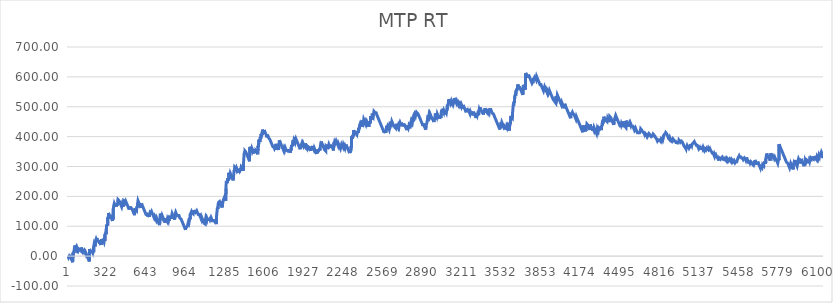
| Category | MTP RT |
|---|---|
| 0 | -1 |
| 1 | -2 |
| 2 | -3 |
| 3 | -4 |
| 4 | -5 |
| 5 | -6 |
| 6 | -7 |
| 7 | -8 |
| 8 | -1.41 |
| 9 | -2.42 |
| 10 | -3.43 |
| 11 | -4.44 |
| 12 | -5.45 |
| 13 | 4 |
| 14 | 2.95 |
| 15 | 1.9 |
| 16 | 0.9 |
| 17 | -0.1 |
| 18 | -1.1 |
| 19 | -2.1 |
| 20 | -3.1 |
| 21 | -4.1 |
| 22 | -5.1 |
| 23 | -6.1 |
| 24 | -7.1 |
| 25 | -8.1 |
| 26 | -9.1 |
| 27 | -10.1 |
| 28 | -11.1 |
| 29 | -12.1 |
| 30 | -13.1 |
| 31 | -14.1 |
| 32 | -15.1 |
| 33 | -16.1 |
| 34 | -17.1 |
| 35 | -18.1 |
| 36 | -19.224 |
| 37 | -20.348 |
| 38 | -21.472 |
| 39 | -22.596 |
| 40 | 12.28 |
| 41 | 11.28 |
| 42 | 10.28 |
| 43 | 9.28 |
| 44 | 8.28 |
| 45 | 7.28 |
| 46 | 6.25 |
| 47 | 15.22 |
| 48 | 14.19 |
| 49 | 13.16 |
| 50 | 12.102 |
| 51 | 11.045 |
| 52 | 25.488 |
| 53 | 24.43 |
| 54 | 23.396 |
| 55 | 35.862 |
| 56 | 34.828 |
| 57 | 33.794 |
| 58 | 32.76 |
| 59 | 31.76 |
| 60 | 30.76 |
| 61 | 29.76 |
| 62 | 28.76 |
| 63 | 27.76 |
| 64 | 26.76 |
| 65 | 25.76 |
| 66 | 24.76 |
| 67 | 23.76 |
| 68 | 22.76 |
| 69 | 27.343 |
| 70 | 26.327 |
| 71 | 25.31 |
| 72 | 24.31 |
| 73 | 23.31 |
| 74 | 22.31 |
| 75 | 27.3 |
| 76 | 26.29 |
| 77 | 25.28 |
| 78 | 24.27 |
| 79 | 23.27 |
| 80 | 22.27 |
| 81 | 21.27 |
| 82 | 20.27 |
| 83 | 19.27 |
| 84 | 18.27 |
| 85 | 17.27 |
| 86 | 16.27 |
| 87 | 23.648 |
| 88 | 22.625 |
| 89 | 21.602 |
| 90 | 20.58 |
| 91 | 25.272 |
| 92 | 24.265 |
| 93 | 23.257 |
| 94 | 22.25 |
| 95 | 21.25 |
| 96 | 20.25 |
| 97 | 19.25 |
| 98 | 18.25 |
| 99 | 17.25 |
| 100 | 22.14 |
| 101 | 21.13 |
| 102 | 20.12 |
| 103 | 19.11 |
| 104 | 18.078 |
| 105 | 17.046 |
| 106 | 29.014 |
| 107 | 27.982 |
| 108 | 26.95 |
| 109 | 25.95 |
| 110 | 24.95 |
| 111 | 23.95 |
| 112 | 22.95 |
| 113 | 21.95 |
| 114 | 20.95 |
| 115 | 19.95 |
| 116 | 18.95 |
| 117 | 17.95 |
| 118 | 16.95 |
| 119 | 15.95 |
| 120 | 14.95 |
| 121 | 13.95 |
| 122 | 12.95 |
| 123 | 11.95 |
| 124 | 10.95 |
| 125 | 16.146 |
| 126 | 15.142 |
| 127 | 14.138 |
| 128 | 13.134 |
| 129 | 12.13 |
| 130 | 11.114 |
| 131 | 19.098 |
| 132 | 18.082 |
| 133 | 17.066 |
| 134 | 16.05 |
| 135 | 15.05 |
| 136 | 14.05 |
| 137 | 13.05 |
| 138 | 12.05 |
| 139 | 11.05 |
| 140 | 10.05 |
| 141 | 9.05 |
| 142 | 8.05 |
| 143 | 7.05 |
| 144 | 6.05 |
| 145 | 10.433 |
| 146 | 9.417 |
| 147 | 8.4 |
| 148 | 7.4 |
| 149 | 6.4 |
| 150 | 5.4 |
| 151 | 4.4 |
| 152 | 3.4 |
| 153 | 2.4 |
| 154 | 1.4 |
| 155 | 0.4 |
| 156 | -0.6 |
| 157 | -1.6 |
| 158 | -2.6 |
| 159 | -3.6 |
| 160 | -4.6 |
| 161 | -5.6 |
| 162 | -6.6 |
| 163 | -7.6 |
| 164 | -8.6 |
| 165 | -9.6 |
| 166 | -10.6 |
| 167 | -11.6 |
| 168 | -12.6 |
| 169 | -13.6 |
| 170 | -14.6 |
| 171 | -15.6 |
| 172 | -16.8 |
| 173 | -18 |
| 174 | -19.2 |
| 175 | 23.6 |
| 176 | 22.6 |
| 177 | 21.6 |
| 178 | 20.6 |
| 179 | 19.6 |
| 180 | 18.6 |
| 181 | 17.6 |
| 182 | 16.6 |
| 183 | 15.6 |
| 184 | 14.6 |
| 185 | 13.6 |
| 186 | 12.6 |
| 187 | 11.6 |
| 188 | 18.986 |
| 189 | 17.972 |
| 190 | 16.958 |
| 191 | 15.944 |
| 192 | 14.93 |
| 193 | 13.93 |
| 194 | 12.93 |
| 195 | 11.93 |
| 196 | 10.93 |
| 197 | 14.93 |
| 198 | 13.93 |
| 199 | 12.93 |
| 200 | 11.93 |
| 201 | 10.93 |
| 202 | 9.93 |
| 203 | 8.93 |
| 204 | 17.09 |
| 205 | 16.05 |
| 206 | 15.01 |
| 207 | 13.905 |
| 208 | 12.8 |
| 209 | 11.695 |
| 210 | 35.59 |
| 211 | 34.575 |
| 212 | 40.76 |
| 213 | 39.745 |
| 214 | 38.73 |
| 215 | 37.73 |
| 216 | 36.73 |
| 217 | 35.73 |
| 218 | 34.73 |
| 219 | 33.73 |
| 220 | 32.73 |
| 221 | 31.64 |
| 222 | 41.55 |
| 223 | 40.516 |
| 224 | 52.982 |
| 225 | 51.948 |
| 226 | 50.914 |
| 227 | 49.88 |
| 228 | 57.86 |
| 229 | 56.84 |
| 230 | 55.82 |
| 231 | 54.8 |
| 232 | 53.785 |
| 233 | 59.77 |
| 234 | 58.755 |
| 235 | 57.74 |
| 236 | 56.74 |
| 237 | 55.74 |
| 238 | 54.74 |
| 239 | 53.74 |
| 240 | 52.74 |
| 241 | 51.74 |
| 242 | 50.74 |
| 243 | 49.74 |
| 244 | 52.67 |
| 245 | 51.65 |
| 246 | 50.65 |
| 247 | 49.65 |
| 248 | 48.65 |
| 249 | 47.65 |
| 250 | 53.044 |
| 251 | 52.038 |
| 252 | 51.032 |
| 253 | 50.026 |
| 254 | 49.02 |
| 255 | 48.02 |
| 256 | 47.02 |
| 257 | 46.02 |
| 258 | 45.02 |
| 259 | 44.02 |
| 260 | 43.02 |
| 261 | 45.667 |
| 262 | 44.663 |
| 263 | 43.66 |
| 264 | 42.66 |
| 265 | 41.66 |
| 266 | 40.66 |
| 267 | 39.66 |
| 268 | 38.66 |
| 269 | 37.57 |
| 270 | 36.48 |
| 271 | 57.39 |
| 272 | 56.3 |
| 273 | 55.3 |
| 274 | 54.3 |
| 275 | 53.3 |
| 276 | 52.3 |
| 277 | 51.3 |
| 278 | 50.3 |
| 279 | 49.3 |
| 280 | 48.3 |
| 281 | 47.3 |
| 282 | 46.3 |
| 283 | 45.278 |
| 284 | 54.756 |
| 285 | 53.734 |
| 286 | 52.712 |
| 287 | 51.69 |
| 288 | 50.69 |
| 289 | 49.69 |
| 290 | 48.69 |
| 291 | 47.69 |
| 292 | 46.69 |
| 293 | 45.666 |
| 294 | 44.642 |
| 295 | 54.618 |
| 296 | 53.594 |
| 297 | 52.57 |
| 298 | 51.49 |
| 299 | 50.41 |
| 300 | 49.33 |
| 301 | 73.25 |
| 302 | 72.17 |
| 303 | 71.17 |
| 304 | 70.17 |
| 305 | 76.958 |
| 306 | 75.946 |
| 307 | 74.934 |
| 308 | 73.922 |
| 309 | 72.91 |
| 310 | 71.73 |
| 311 | 70.55 |
| 312 | 99.37 |
| 313 | 105.162 |
| 314 | 104.154 |
| 315 | 103.146 |
| 316 | 102.138 |
| 317 | 101.13 |
| 318 | 107.315 |
| 319 | 106.3 |
| 320 | 105.285 |
| 321 | 104.27 |
| 322 | 103.11 |
| 323 | 128.95 |
| 324 | 127.79 |
| 325 | 126.705 |
| 326 | 125.62 |
| 327 | 124.535 |
| 328 | 144.45 |
| 329 | 143.45 |
| 330 | 142.45 |
| 331 | 141.45 |
| 332 | 140.45 |
| 333 | 139.45 |
| 334 | 138.45 |
| 335 | 137.45 |
| 336 | 136.45 |
| 337 | 135.45 |
| 338 | 134.45 |
| 339 | 133.45 |
| 340 | 132.45 |
| 341 | 137.827 |
| 342 | 136.803 |
| 343 | 135.78 |
| 344 | 134.78 |
| 345 | 133.78 |
| 346 | 132.78 |
| 347 | 131.78 |
| 348 | 130.78 |
| 349 | 129.78 |
| 350 | 128.78 |
| 351 | 127.78 |
| 352 | 126.78 |
| 353 | 125.78 |
| 354 | 124.78 |
| 355 | 123.78 |
| 356 | 122.78 |
| 357 | 121.78 |
| 358 | 120.78 |
| 359 | 119.78 |
| 360 | 118.78 |
| 361 | 117.78 |
| 362 | 126.733 |
| 363 | 125.687 |
| 364 | 124.64 |
| 365 | 123.46 |
| 366 | 122.28 |
| 367 | 121.1 |
| 368 | 159.92 |
| 369 | 158.878 |
| 370 | 157.836 |
| 371 | 156.794 |
| 372 | 171.252 |
| 373 | 170.21 |
| 374 | 169.198 |
| 375 | 176.386 |
| 376 | 175.374 |
| 377 | 174.362 |
| 378 | 173.35 |
| 379 | 172.35 |
| 380 | 171.35 |
| 381 | 170.35 |
| 382 | 169.35 |
| 383 | 168.346 |
| 384 | 173.342 |
| 385 | 172.338 |
| 386 | 171.334 |
| 387 | 170.33 |
| 388 | 169.33 |
| 389 | 168.33 |
| 390 | 167.33 |
| 391 | 166.33 |
| 392 | 165.33 |
| 393 | 164.26 |
| 394 | 172.39 |
| 395 | 171.39 |
| 396 | 170.39 |
| 397 | 169.39 |
| 398 | 168.39 |
| 399 | 167.364 |
| 400 | 177.838 |
| 401 | 176.812 |
| 402 | 175.786 |
| 403 | 174.76 |
| 404 | 173.692 |
| 405 | 172.625 |
| 406 | 189.057 |
| 407 | 187.99 |
| 408 | 192.177 |
| 409 | 191.163 |
| 410 | 190.15 |
| 411 | 189.15 |
| 412 | 188.15 |
| 413 | 187.15 |
| 414 | 186.15 |
| 415 | 185.15 |
| 416 | 184.15 |
| 417 | 183.15 |
| 418 | 182.15 |
| 419 | 181.15 |
| 420 | 180.15 |
| 421 | 179.15 |
| 422 | 178.15 |
| 423 | 177.15 |
| 424 | 176.15 |
| 425 | 175.15 |
| 426 | 174.15 |
| 427 | 173.15 |
| 428 | 172.15 |
| 429 | 171.15 |
| 430 | 170.15 |
| 431 | 169.15 |
| 432 | 168.15 |
| 433 | 167.15 |
| 434 | 166.15 |
| 435 | 165.15 |
| 436 | 164.15 |
| 437 | 163.15 |
| 438 | 162.15 |
| 439 | 173.122 |
| 440 | 172.094 |
| 441 | 171.066 |
| 442 | 170.038 |
| 443 | 169.01 |
| 444 | 168.01 |
| 445 | 167.01 |
| 446 | 166.01 |
| 447 | 164.926 |
| 448 | 163.842 |
| 449 | 162.758 |
| 450 | 161.674 |
| 451 | 186.59 |
| 452 | 185.59 |
| 453 | 184.59 |
| 454 | 183.59 |
| 455 | 189.178 |
| 456 | 188.165 |
| 457 | 187.152 |
| 458 | 186.14 |
| 459 | 185.14 |
| 460 | 184.14 |
| 461 | 183.14 |
| 462 | 182.14 |
| 463 | 181.14 |
| 464 | 180.14 |
| 465 | 179.14 |
| 466 | 178.14 |
| 467 | 177.08 |
| 468 | 184.22 |
| 469 | 183.22 |
| 470 | 182.22 |
| 471 | 181.22 |
| 472 | 180.22 |
| 473 | 179.22 |
| 474 | 178.22 |
| 475 | 177.22 |
| 476 | 176.22 |
| 477 | 175.22 |
| 478 | 174.22 |
| 479 | 173.22 |
| 480 | 172.22 |
| 481 | 171.22 |
| 482 | 170.22 |
| 483 | 169.22 |
| 484 | 168.22 |
| 485 | 167.22 |
| 486 | 166.22 |
| 487 | 165.22 |
| 488 | 164.22 |
| 489 | 163.22 |
| 490 | 162.22 |
| 491 | 161.22 |
| 492 | 160.22 |
| 493 | 159.22 |
| 494 | 158.22 |
| 495 | 157.22 |
| 496 | 156.2 |
| 497 | 165.18 |
| 498 | 164.16 |
| 499 | 163.14 |
| 500 | 162.12 |
| 501 | 161.12 |
| 502 | 160.12 |
| 503 | 159.12 |
| 504 | 158.12 |
| 505 | 157.12 |
| 506 | 156.12 |
| 507 | 165.09 |
| 508 | 164.06 |
| 509 | 163.03 |
| 510 | 162 |
| 511 | 161 |
| 512 | 160 |
| 513 | 159 |
| 514 | 157.992 |
| 515 | 162.285 |
| 516 | 161.278 |
| 517 | 160.27 |
| 518 | 159.27 |
| 519 | 158.27 |
| 520 | 157.27 |
| 521 | 156.27 |
| 522 | 155.27 |
| 523 | 154.27 |
| 524 | 153.27 |
| 525 | 152.27 |
| 526 | 151.27 |
| 527 | 150.27 |
| 528 | 149.27 |
| 529 | 148.27 |
| 530 | 147.27 |
| 531 | 146.27 |
| 532 | 145.27 |
| 533 | 144.27 |
| 534 | 143.27 |
| 535 | 142.27 |
| 536 | 141.27 |
| 537 | 140.27 |
| 538 | 139.27 |
| 539 | 138.225 |
| 540 | 137.18 |
| 541 | 149.135 |
| 542 | 148.09 |
| 543 | 147.013 |
| 544 | 160.437 |
| 545 | 159.36 |
| 546 | 158.36 |
| 547 | 157.36 |
| 548 | 156.36 |
| 549 | 155.36 |
| 550 | 154.36 |
| 551 | 153.36 |
| 552 | 156.36 |
| 553 | 155.36 |
| 554 | 154.36 |
| 555 | 153.36 |
| 556 | 152.36 |
| 557 | 151.31 |
| 558 | 150.26 |
| 559 | 166.71 |
| 560 | 165.66 |
| 561 | 164.61 |
| 562 | 163.58 |
| 563 | 162.55 |
| 564 | 174.02 |
| 565 | 172.99 |
| 566 | 171.96 |
| 567 | 170.918 |
| 568 | 185.376 |
| 569 | 184.334 |
| 570 | 183.292 |
| 571 | 182.25 |
| 572 | 181.25 |
| 573 | 180.25 |
| 574 | 179.25 |
| 575 | 178.25 |
| 576 | 177.25 |
| 577 | 176.25 |
| 578 | 175.25 |
| 579 | 174.25 |
| 580 | 173.25 |
| 581 | 172.25 |
| 582 | 171.25 |
| 583 | 170.25 |
| 584 | 169.25 |
| 585 | 168.25 |
| 586 | 167.25 |
| 587 | 166.25 |
| 588 | 165.25 |
| 589 | 164.25 |
| 590 | 163.25 |
| 591 | 162.25 |
| 592 | 161.25 |
| 593 | 160.25 |
| 594 | 159.172 |
| 595 | 158.095 |
| 596 | 176.518 |
| 597 | 175.44 |
| 598 | 174.44 |
| 599 | 173.44 |
| 600 | 172.44 |
| 601 | 171.44 |
| 602 | 170.44 |
| 603 | 169.44 |
| 604 | 168.44 |
| 605 | 167.44 |
| 606 | 166.44 |
| 607 | 165.44 |
| 608 | 164.44 |
| 609 | 163.44 |
| 610 | 162.44 |
| 611 | 161.44 |
| 612 | 160.44 |
| 613 | 159.44 |
| 614 | 158.44 |
| 615 | 157.44 |
| 616 | 156.44 |
| 617 | 155.44 |
| 618 | 154.44 |
| 619 | 153.44 |
| 620 | 152.44 |
| 621 | 151.44 |
| 622 | 150.44 |
| 623 | 149.44 |
| 624 | 148.44 |
| 625 | 147.44 |
| 626 | 146.44 |
| 627 | 145.44 |
| 628 | 144.44 |
| 629 | 143.44 |
| 630 | 142.44 |
| 631 | 141.44 |
| 632 | 140.44 |
| 633 | 139.44 |
| 634 | 138.44 |
| 635 | 137.44 |
| 636 | 136.44 |
| 637 | 135.41 |
| 638 | 144.38 |
| 639 | 143.35 |
| 640 | 142.32 |
| 641 | 141.32 |
| 642 | 140.32 |
| 643 | 139.32 |
| 644 | 138.32 |
| 645 | 137.32 |
| 646 | 136.32 |
| 647 | 135.32 |
| 648 | 134.32 |
| 649 | 133.32 |
| 650 | 132.295 |
| 651 | 131.27 |
| 652 | 139.045 |
| 653 | 138.02 |
| 654 | 137.02 |
| 655 | 136.02 |
| 656 | 135.02 |
| 657 | 134.02 |
| 658 | 133.02 |
| 659 | 131.998 |
| 660 | 130.976 |
| 661 | 140.454 |
| 662 | 139.432 |
| 663 | 138.41 |
| 664 | 141.045 |
| 665 | 140.03 |
| 666 | 139 |
| 667 | 147.97 |
| 668 | 146.94 |
| 669 | 145.91 |
| 670 | 150.9 |
| 671 | 149.89 |
| 672 | 148.88 |
| 673 | 147.87 |
| 674 | 146.87 |
| 675 | 145.87 |
| 676 | 144.87 |
| 677 | 143.87 |
| 678 | 142.87 |
| 679 | 148.258 |
| 680 | 147.245 |
| 681 | 146.232 |
| 682 | 145.22 |
| 683 | 144.22 |
| 684 | 143.22 |
| 685 | 142.22 |
| 686 | 141.22 |
| 687 | 140.22 |
| 688 | 139.22 |
| 689 | 138.22 |
| 690 | 137.22 |
| 691 | 136.22 |
| 692 | 135.22 |
| 693 | 134.22 |
| 694 | 133.22 |
| 695 | 132.22 |
| 696 | 131.22 |
| 697 | 130.22 |
| 698 | 129.22 |
| 699 | 128.22 |
| 700 | 127.22 |
| 701 | 126.22 |
| 702 | 125.18 |
| 703 | 132.94 |
| 704 | 131.9 |
| 705 | 130.9 |
| 706 | 129.9 |
| 707 | 128.9 |
| 708 | 127.9 |
| 709 | 126.9 |
| 710 | 125.9 |
| 711 | 124.9 |
| 712 | 123.9 |
| 713 | 122.9 |
| 714 | 121.9 |
| 715 | 120.9 |
| 716 | 119.9 |
| 717 | 118.876 |
| 718 | 117.852 |
| 719 | 127.828 |
| 720 | 126.804 |
| 721 | 125.78 |
| 722 | 124.78 |
| 723 | 123.78 |
| 724 | 122.78 |
| 725 | 121.78 |
| 726 | 120.78 |
| 727 | 119.78 |
| 728 | 118.78 |
| 729 | 117.78 |
| 730 | 116.78 |
| 731 | 115.78 |
| 732 | 114.78 |
| 733 | 113.78 |
| 734 | 112.78 |
| 735 | 111.78 |
| 736 | 110.78 |
| 737 | 109.78 |
| 738 | 108.78 |
| 739 | 107.78 |
| 740 | 106.78 |
| 741 | 105.78 |
| 742 | 104.78 |
| 743 | 103.78 |
| 744 | 102.78 |
| 745 | 101.53 |
| 746 | 127.28 |
| 747 | 126.177 |
| 748 | 125.073 |
| 749 | 142.47 |
| 750 | 141.47 |
| 751 | 140.47 |
| 752 | 139.47 |
| 753 | 138.47 |
| 754 | 137.47 |
| 755 | 136.47 |
| 756 | 135.47 |
| 757 | 134.47 |
| 758 | 133.47 |
| 759 | 132.47 |
| 760 | 131.47 |
| 761 | 130.47 |
| 762 | 129.47 |
| 763 | 128.456 |
| 764 | 136.042 |
| 765 | 135.028 |
| 766 | 134.014 |
| 767 | 133 |
| 768 | 132 |
| 769 | 131 |
| 770 | 130 |
| 771 | 129 |
| 772 | 128 |
| 773 | 127 |
| 774 | 126 |
| 775 | 125 |
| 776 | 124 |
| 777 | 123 |
| 778 | 122 |
| 779 | 121 |
| 780 | 120 |
| 781 | 119 |
| 782 | 118 |
| 783 | 117 |
| 784 | 116 |
| 785 | 115 |
| 786 | 114 |
| 787 | 113 |
| 788 | 112 |
| 789 | 111 |
| 790 | 119.184 |
| 791 | 118.168 |
| 792 | 117.152 |
| 793 | 116.136 |
| 794 | 115.12 |
| 795 | 114.084 |
| 796 | 127.048 |
| 797 | 126.012 |
| 798 | 124.976 |
| 799 | 123.94 |
| 800 | 122.94 |
| 801 | 121.94 |
| 802 | 120.94 |
| 803 | 119.94 |
| 804 | 118.94 |
| 805 | 117.924 |
| 806 | 116.908 |
| 807 | 125.092 |
| 808 | 124.076 |
| 809 | 123.06 |
| 810 | 122.06 |
| 811 | 121.06 |
| 812 | 120.06 |
| 813 | 119.06 |
| 814 | 118.06 |
| 815 | 117.06 |
| 816 | 116.06 |
| 817 | 121.654 |
| 818 | 120.648 |
| 819 | 119.642 |
| 820 | 118.636 |
| 821 | 117.63 |
| 822 | 126.383 |
| 823 | 125.337 |
| 824 | 124.29 |
| 825 | 131.074 |
| 826 | 130.058 |
| 827 | 129.042 |
| 828 | 128.026 |
| 829 | 134.218 |
| 830 | 133.21 |
| 831 | 132.202 |
| 832 | 131.194 |
| 833 | 130.186 |
| 834 | 129.186 |
| 835 | 128.186 |
| 836 | 127.186 |
| 837 | 126.186 |
| 838 | 125.156 |
| 839 | 124.126 |
| 840 | 123.096 |
| 841 | 134.566 |
| 842 | 133.536 |
| 843 | 132.508 |
| 844 | 131.48 |
| 845 | 142.452 |
| 846 | 141.424 |
| 847 | 140.396 |
| 848 | 139.396 |
| 849 | 138.396 |
| 850 | 137.396 |
| 851 | 136.396 |
| 852 | 135.396 |
| 853 | 134.396 |
| 854 | 133.396 |
| 855 | 132.396 |
| 856 | 131.396 |
| 857 | 130.396 |
| 858 | 129.396 |
| 859 | 128.396 |
| 860 | 127.396 |
| 861 | 126.396 |
| 862 | 125.396 |
| 863 | 124.396 |
| 864 | 123.35 |
| 865 | 122.304 |
| 866 | 121.258 |
| 867 | 120.212 |
| 868 | 135.666 |
| 869 | 134.651 |
| 870 | 140.836 |
| 871 | 139.821 |
| 872 | 138.806 |
| 873 | 137.786 |
| 874 | 146.766 |
| 875 | 145.746 |
| 876 | 144.726 |
| 877 | 143.706 |
| 878 | 142.706 |
| 879 | 141.706 |
| 880 | 140.706 |
| 881 | 139.706 |
| 882 | 138.706 |
| 883 | 137.706 |
| 884 | 136.706 |
| 885 | 135.706 |
| 886 | 134.706 |
| 887 | 133.706 |
| 888 | 132.706 |
| 889 | 131.706 |
| 890 | 130.706 |
| 891 | 129.706 |
| 892 | 138.686 |
| 893 | 137.666 |
| 894 | 136.646 |
| 895 | 135.626 |
| 896 | 134.606 |
| 897 | 138.801 |
| 898 | 137.796 |
| 899 | 136.791 |
| 900 | 135.786 |
| 901 | 134.786 |
| 902 | 133.786 |
| 903 | 132.786 |
| 904 | 131.786 |
| 905 | 130.786 |
| 906 | 129.786 |
| 907 | 128.786 |
| 908 | 127.786 |
| 909 | 126.786 |
| 910 | 125.786 |
| 911 | 124.786 |
| 912 | 123.786 |
| 913 | 128.976 |
| 914 | 127.966 |
| 915 | 126.956 |
| 916 | 125.946 |
| 917 | 124.946 |
| 918 | 123.946 |
| 919 | 122.946 |
| 920 | 121.946 |
| 921 | 120.946 |
| 922 | 119.946 |
| 923 | 118.946 |
| 924 | 117.946 |
| 925 | 116.946 |
| 926 | 115.946 |
| 927 | 114.946 |
| 928 | 113.946 |
| 929 | 112.946 |
| 930 | 111.946 |
| 931 | 110.946 |
| 932 | 109.946 |
| 933 | 108.946 |
| 934 | 107.946 |
| 935 | 106.946 |
| 936 | 105.946 |
| 937 | 104.946 |
| 938 | 103.946 |
| 939 | 102.946 |
| 940 | 101.946 |
| 941 | 100.946 |
| 942 | 99.946 |
| 943 | 98.946 |
| 944 | 97.946 |
| 945 | 96.946 |
| 946 | 95.946 |
| 947 | 94.946 |
| 948 | 93.946 |
| 949 | 92.946 |
| 950 | 91.946 |
| 951 | 90.946 |
| 952 | 89.946 |
| 953 | 88.946 |
| 954 | 87.946 |
| 955 | 86.904 |
| 956 | 100.362 |
| 957 | 99.32 |
| 958 | 98.278 |
| 959 | 97.278 |
| 960 | 96.278 |
| 961 | 95.278 |
| 962 | 94.278 |
| 963 | 97.978 |
| 964 | 96.978 |
| 965 | 95.978 |
| 966 | 94.978 |
| 967 | 93.978 |
| 968 | 92.962 |
| 969 | 100.746 |
| 970 | 99.73 |
| 971 | 98.714 |
| 972 | 97.698 |
| 973 | 108.141 |
| 974 | 107.085 |
| 975 | 106.028 |
| 976 | 104.978 |
| 977 | 110.728 |
| 978 | 116.116 |
| 979 | 115.103 |
| 980 | 114.09 |
| 981 | 113.078 |
| 982 | 112.042 |
| 983 | 111.006 |
| 984 | 109.97 |
| 985 | 108.934 |
| 986 | 121.898 |
| 987 | 126.794 |
| 988 | 125.79 |
| 989 | 124.786 |
| 990 | 123.782 |
| 991 | 122.778 |
| 992 | 121.706 |
| 993 | 141.634 |
| 994 | 140.562 |
| 995 | 139.562 |
| 996 | 138.562 |
| 997 | 137.562 |
| 998 | 144.939 |
| 999 | 143.917 |
| 1000 | 142.894 |
| 1001 | 141.872 |
| 1002 | 148.86 |
| 1003 | 147.848 |
| 1004 | 146.836 |
| 1005 | 145.824 |
| 1006 | 144.812 |
| 1007 | 143.812 |
| 1008 | 142.812 |
| 1009 | 141.812 |
| 1010 | 146.808 |
| 1011 | 145.804 |
| 1012 | 144.8 |
| 1013 | 143.796 |
| 1014 | 142.792 |
| 1015 | 141.76 |
| 1016 | 153.728 |
| 1017 | 152.696 |
| 1018 | 151.664 |
| 1019 | 150.632 |
| 1020 | 149.632 |
| 1021 | 148.632 |
| 1022 | 147.632 |
| 1023 | 146.632 |
| 1024 | 145.632 |
| 1025 | 144.632 |
| 1026 | 143.632 |
| 1027 | 142.632 |
| 1028 | 141.632 |
| 1029 | 140.6 |
| 1030 | 139.568 |
| 1031 | 151.536 |
| 1032 | 150.504 |
| 1033 | 149.472 |
| 1034 | 148.472 |
| 1035 | 147.472 |
| 1036 | 146.472 |
| 1037 | 145.472 |
| 1038 | 144.472 |
| 1039 | 149.866 |
| 1040 | 148.86 |
| 1041 | 147.854 |
| 1042 | 146.848 |
| 1043 | 145.842 |
| 1044 | 152.432 |
| 1045 | 151.422 |
| 1046 | 150.412 |
| 1047 | 149.402 |
| 1048 | 148.392 |
| 1049 | 147.392 |
| 1050 | 146.392 |
| 1051 | 145.392 |
| 1052 | 144.392 |
| 1053 | 143.392 |
| 1054 | 142.392 |
| 1055 | 141.392 |
| 1056 | 140.392 |
| 1057 | 139.392 |
| 1058 | 138.392 |
| 1059 | 137.392 |
| 1060 | 136.392 |
| 1061 | 135.376 |
| 1062 | 143.16 |
| 1063 | 142.144 |
| 1064 | 141.128 |
| 1065 | 140.112 |
| 1066 | 139.112 |
| 1067 | 138.112 |
| 1068 | 137.112 |
| 1069 | 136.112 |
| 1070 | 135.112 |
| 1071 | 134.112 |
| 1072 | 133.112 |
| 1073 | 132.112 |
| 1074 | 131.112 |
| 1075 | 130.112 |
| 1076 | 129.112 |
| 1077 | 128.112 |
| 1078 | 127.112 |
| 1079 | 126.112 |
| 1080 | 125.112 |
| 1081 | 124.112 |
| 1082 | 123.112 |
| 1083 | 122.112 |
| 1084 | 121.112 |
| 1085 | 130.092 |
| 1086 | 129.072 |
| 1087 | 128.052 |
| 1088 | 127.032 |
| 1089 | 126.012 |
| 1090 | 125.012 |
| 1091 | 124.012 |
| 1092 | 123.012 |
| 1093 | 122.012 |
| 1094 | 121.012 |
| 1095 | 120.012 |
| 1096 | 119.012 |
| 1097 | 118.012 |
| 1098 | 117.012 |
| 1099 | 116.012 |
| 1100 | 115.012 |
| 1101 | 114.012 |
| 1102 | 113.012 |
| 1103 | 112.012 |
| 1104 | 111.012 |
| 1105 | 110.012 |
| 1106 | 109.012 |
| 1107 | 108.012 |
| 1108 | 107.012 |
| 1109 | 112.399 |
| 1110 | 111.387 |
| 1111 | 110.374 |
| 1112 | 109.362 |
| 1113 | 108.362 |
| 1114 | 107.362 |
| 1115 | 106.294 |
| 1116 | 122.727 |
| 1117 | 121.659 |
| 1118 | 120.592 |
| 1119 | 129.545 |
| 1120 | 128.499 |
| 1121 | 127.452 |
| 1122 | 126.452 |
| 1123 | 125.452 |
| 1124 | 124.452 |
| 1125 | 123.452 |
| 1126 | 122.452 |
| 1127 | 121.452 |
| 1128 | 120.452 |
| 1129 | 126.039 |
| 1130 | 125.027 |
| 1131 | 124.014 |
| 1132 | 123.002 |
| 1133 | 122.002 |
| 1134 | 121.002 |
| 1135 | 120.002 |
| 1136 | 119.002 |
| 1137 | 118.002 |
| 1138 | 116.972 |
| 1139 | 127.442 |
| 1140 | 126.412 |
| 1141 | 125.382 |
| 1142 | 124.382 |
| 1143 | 123.382 |
| 1144 | 122.382 |
| 1145 | 121.382 |
| 1146 | 120.382 |
| 1147 | 119.349 |
| 1148 | 126.115 |
| 1149 | 125.082 |
| 1150 | 124.082 |
| 1151 | 123.082 |
| 1152 | 122.082 |
| 1153 | 121.082 |
| 1154 | 120.082 |
| 1155 | 119.068 |
| 1156 | 126.654 |
| 1157 | 125.64 |
| 1158 | 124.626 |
| 1159 | 123.612 |
| 1160 | 130.157 |
| 1161 | 129.102 |
| 1162 | 128.102 |
| 1163 | 127.102 |
| 1164 | 126.102 |
| 1165 | 125.102 |
| 1166 | 124.102 |
| 1167 | 123.102 |
| 1168 | 122.102 |
| 1169 | 121.102 |
| 1170 | 120.102 |
| 1171 | 119.102 |
| 1172 | 118.102 |
| 1173 | 117.102 |
| 1174 | 116.102 |
| 1175 | 115.102 |
| 1176 | 114.102 |
| 1177 | 113.08 |
| 1178 | 122.558 |
| 1179 | 121.536 |
| 1180 | 120.514 |
| 1181 | 119.492 |
| 1182 | 118.492 |
| 1183 | 117.492 |
| 1184 | 116.492 |
| 1185 | 121.688 |
| 1186 | 120.684 |
| 1187 | 119.68 |
| 1188 | 118.676 |
| 1189 | 117.672 |
| 1190 | 116.672 |
| 1191 | 115.672 |
| 1192 | 114.672 |
| 1193 | 118.467 |
| 1194 | 117.462 |
| 1195 | 116.457 |
| 1196 | 115.452 |
| 1197 | 114.452 |
| 1198 | 113.452 |
| 1199 | 112.452 |
| 1200 | 111.452 |
| 1201 | 110.452 |
| 1202 | 109.352 |
| 1203 | 108.252 |
| 1204 | 107.152 |
| 1205 | 106.052 |
| 1206 | 134.952 |
| 1207 | 133.912 |
| 1208 | 132.872 |
| 1209 | 146.832 |
| 1210 | 145.792 |
| 1211 | 144.752 |
| 1212 | 143.672 |
| 1213 | 162.592 |
| 1214 | 161.512 |
| 1215 | 160.432 |
| 1216 | 159.374 |
| 1217 | 158.316 |
| 1218 | 157.258 |
| 1219 | 156.2 |
| 1220 | 174.642 |
| 1221 | 173.634 |
| 1222 | 179.626 |
| 1223 | 178.618 |
| 1224 | 177.61 |
| 1225 | 176.602 |
| 1226 | 181.798 |
| 1227 | 180.794 |
| 1228 | 179.79 |
| 1229 | 178.786 |
| 1230 | 177.782 |
| 1231 | 182.978 |
| 1232 | 181.974 |
| 1233 | 180.97 |
| 1234 | 179.966 |
| 1235 | 178.962 |
| 1236 | 177.962 |
| 1237 | 176.962 |
| 1238 | 175.962 |
| 1239 | 174.962 |
| 1240 | 173.962 |
| 1241 | 172.962 |
| 1242 | 171.962 |
| 1243 | 170.962 |
| 1244 | 169.962 |
| 1245 | 168.962 |
| 1246 | 167.962 |
| 1247 | 166.962 |
| 1248 | 165.962 |
| 1249 | 164.89 |
| 1250 | 163.818 |
| 1251 | 162.746 |
| 1252 | 161.674 |
| 1253 | 183.602 |
| 1254 | 182.602 |
| 1255 | 181.602 |
| 1256 | 180.602 |
| 1257 | 179.602 |
| 1258 | 178.602 |
| 1259 | 177.574 |
| 1260 | 176.546 |
| 1261 | 187.518 |
| 1262 | 186.49 |
| 1263 | 185.462 |
| 1264 | 189.362 |
| 1265 | 188.362 |
| 1266 | 187.362 |
| 1267 | 186.362 |
| 1268 | 185.362 |
| 1269 | 184.326 |
| 1270 | 197.29 |
| 1271 | 196.254 |
| 1272 | 195.218 |
| 1273 | 194.182 |
| 1274 | 193.182 |
| 1275 | 192.182 |
| 1276 | 191.182 |
| 1277 | 190.182 |
| 1278 | 189.182 |
| 1279 | 187.992 |
| 1280 | 186.802 |
| 1281 | 185.612 |
| 1282 | 226.422 |
| 1283 | 225.297 |
| 1284 | 224.172 |
| 1285 | 252.047 |
| 1286 | 250.922 |
| 1287 | 249.922 |
| 1288 | 248.922 |
| 1289 | 247.922 |
| 1290 | 246.922 |
| 1291 | 245.922 |
| 1292 | 244.866 |
| 1293 | 243.81 |
| 1294 | 242.754 |
| 1295 | 260.698 |
| 1296 | 259.642 |
| 1297 | 258.642 |
| 1298 | 257.642 |
| 1299 | 256.642 |
| 1300 | 255.642 |
| 1301 | 254.642 |
| 1302 | 253.542 |
| 1303 | 252.442 |
| 1304 | 251.342 |
| 1305 | 250.242 |
| 1306 | 279.142 |
| 1307 | 278.142 |
| 1308 | 277.142 |
| 1309 | 276.142 |
| 1310 | 275.142 |
| 1311 | 274.142 |
| 1312 | 273.142 |
| 1313 | 272.142 |
| 1314 | 271.142 |
| 1315 | 270.114 |
| 1316 | 269.087 |
| 1317 | 277.66 |
| 1318 | 276.632 |
| 1319 | 275.632 |
| 1320 | 274.632 |
| 1321 | 273.632 |
| 1322 | 272.632 |
| 1323 | 271.632 |
| 1324 | 270.632 |
| 1325 | 269.632 |
| 1326 | 268.632 |
| 1327 | 267.632 |
| 1328 | 266.632 |
| 1329 | 265.632 |
| 1330 | 264.632 |
| 1331 | 263.632 |
| 1332 | 262.632 |
| 1333 | 261.632 |
| 1334 | 260.632 |
| 1335 | 259.632 |
| 1336 | 258.632 |
| 1337 | 257.632 |
| 1338 | 256.632 |
| 1339 | 255.632 |
| 1340 | 254.632 |
| 1341 | 253.632 |
| 1342 | 257.222 |
| 1343 | 256.212 |
| 1344 | 255.202 |
| 1345 | 253.972 |
| 1346 | 277.742 |
| 1347 | 276.706 |
| 1348 | 275.67 |
| 1349 | 288.634 |
| 1350 | 287.598 |
| 1351 | 286.562 |
| 1352 | 285.512 |
| 1353 | 284.462 |
| 1354 | 297.412 |
| 1355 | 296.362 |
| 1356 | 299.362 |
| 1357 | 298.362 |
| 1358 | 297.362 |
| 1359 | 296.362 |
| 1360 | 295.362 |
| 1361 | 294.362 |
| 1362 | 293.362 |
| 1363 | 292.362 |
| 1364 | 291.362 |
| 1365 | 290.362 |
| 1366 | 289.362 |
| 1367 | 288.362 |
| 1368 | 287.348 |
| 1369 | 294.734 |
| 1370 | 293.72 |
| 1371 | 292.706 |
| 1372 | 291.692 |
| 1373 | 290.692 |
| 1374 | 289.692 |
| 1375 | 288.692 |
| 1376 | 287.692 |
| 1377 | 286.692 |
| 1378 | 285.692 |
| 1379 | 284.692 |
| 1380 | 283.692 |
| 1381 | 282.692 |
| 1382 | 281.692 |
| 1383 | 280.652 |
| 1384 | 279.612 |
| 1385 | 278.572 |
| 1386 | 292.532 |
| 1387 | 291.492 |
| 1388 | 290.492 |
| 1389 | 289.492 |
| 1390 | 288.492 |
| 1391 | 287.492 |
| 1392 | 286.492 |
| 1393 | 285.492 |
| 1394 | 284.492 |
| 1395 | 283.492 |
| 1396 | 282.492 |
| 1397 | 285.585 |
| 1398 | 284.579 |
| 1399 | 283.572 |
| 1400 | 289.364 |
| 1401 | 288.356 |
| 1402 | 287.348 |
| 1403 | 286.34 |
| 1404 | 285.332 |
| 1405 | 284.288 |
| 1406 | 283.244 |
| 1407 | 298.2 |
| 1408 | 297.156 |
| 1409 | 296.112 |
| 1410 | 299.055 |
| 1411 | 298.049 |
| 1412 | 297.042 |
| 1413 | 296.042 |
| 1414 | 295.042 |
| 1415 | 294.042 |
| 1416 | 293.042 |
| 1417 | 292.042 |
| 1418 | 291.042 |
| 1419 | 290.042 |
| 1420 | 289.042 |
| 1421 | 287.942 |
| 1422 | 286.842 |
| 1423 | 285.742 |
| 1424 | 284.642 |
| 1425 | 313.542 |
| 1426 | 312.442 |
| 1427 | 311.342 |
| 1428 | 310.242 |
| 1429 | 339.142 |
| 1430 | 338.042 |
| 1431 | 346.614 |
| 1432 | 345.587 |
| 1433 | 344.559 |
| 1434 | 343.532 |
| 1435 | 342.442 |
| 1436 | 352.352 |
| 1437 | 351.352 |
| 1438 | 350.352 |
| 1439 | 349.352 |
| 1440 | 351.849 |
| 1441 | 350.845 |
| 1442 | 349.842 |
| 1443 | 348.842 |
| 1444 | 347.842 |
| 1445 | 346.842 |
| 1446 | 345.842 |
| 1447 | 344.842 |
| 1448 | 343.842 |
| 1449 | 342.842 |
| 1450 | 341.842 |
| 1451 | 340.842 |
| 1452 | 339.842 |
| 1453 | 338.842 |
| 1454 | 337.842 |
| 1455 | 336.842 |
| 1456 | 335.842 |
| 1457 | 334.842 |
| 1458 | 333.842 |
| 1459 | 332.842 |
| 1460 | 331.842 |
| 1461 | 330.842 |
| 1462 | 329.842 |
| 1463 | 328.842 |
| 1464 | 327.842 |
| 1465 | 326.842 |
| 1466 | 325.842 |
| 1467 | 324.842 |
| 1468 | 323.842 |
| 1469 | 322.842 |
| 1470 | 321.842 |
| 1471 | 320.842 |
| 1472 | 319.842 |
| 1473 | 318.542 |
| 1474 | 317.242 |
| 1475 | 363.942 |
| 1476 | 362.942 |
| 1477 | 361.942 |
| 1478 | 360.942 |
| 1479 | 359.942 |
| 1480 | 365.934 |
| 1481 | 364.926 |
| 1482 | 363.918 |
| 1483 | 362.91 |
| 1484 | 361.902 |
| 1485 | 360.902 |
| 1486 | 359.902 |
| 1487 | 358.902 |
| 1488 | 357.902 |
| 1489 | 356.902 |
| 1490 | 355.902 |
| 1491 | 354.902 |
| 1492 | 353.902 |
| 1493 | 352.902 |
| 1494 | 359.69 |
| 1495 | 358.678 |
| 1496 | 357.666 |
| 1497 | 356.654 |
| 1498 | 355.642 |
| 1499 | 354.642 |
| 1500 | 353.642 |
| 1501 | 352.642 |
| 1502 | 351.642 |
| 1503 | 350.642 |
| 1504 | 349.642 |
| 1505 | 348.642 |
| 1506 | 347.642 |
| 1507 | 346.642 |
| 1508 | 345.642 |
| 1509 | 344.642 |
| 1510 | 343.596 |
| 1511 | 342.55 |
| 1512 | 358.004 |
| 1513 | 356.958 |
| 1514 | 355.912 |
| 1515 | 354.912 |
| 1516 | 353.912 |
| 1517 | 352.912 |
| 1518 | 351.912 |
| 1519 | 350.912 |
| 1520 | 349.912 |
| 1521 | 348.912 |
| 1522 | 347.912 |
| 1523 | 346.912 |
| 1524 | 345.9 |
| 1525 | 352.888 |
| 1526 | 351.876 |
| 1527 | 350.864 |
| 1528 | 349.852 |
| 1529 | 353.045 |
| 1530 | 352.039 |
| 1531 | 351.032 |
| 1532 | 350.032 |
| 1533 | 349.032 |
| 1534 | 348.032 |
| 1535 | 347.032 |
| 1536 | 346.032 |
| 1537 | 345.032 |
| 1538 | 344.032 |
| 1539 | 342.902 |
| 1540 | 341.772 |
| 1541 | 340.642 |
| 1542 | 369.512 |
| 1543 | 368.512 |
| 1544 | 367.512 |
| 1545 | 366.512 |
| 1546 | 365.512 |
| 1547 | 364.512 |
| 1548 | 363.339 |
| 1549 | 362.165 |
| 1550 | 389.992 |
| 1551 | 388.992 |
| 1552 | 387.992 |
| 1553 | 386.992 |
| 1554 | 385.992 |
| 1555 | 384.992 |
| 1556 | 383.992 |
| 1557 | 382.992 |
| 1558 | 381.912 |
| 1559 | 380.832 |
| 1560 | 379.752 |
| 1561 | 398.672 |
| 1562 | 397.672 |
| 1563 | 396.672 |
| 1564 | 395.672 |
| 1565 | 394.672 |
| 1566 | 393.527 |
| 1567 | 408.882 |
| 1568 | 407.882 |
| 1569 | 406.882 |
| 1570 | 405.882 |
| 1571 | 404.882 |
| 1572 | 403.882 |
| 1573 | 408.474 |
| 1574 | 407.467 |
| 1575 | 406.46 |
| 1576 | 405.452 |
| 1577 | 404.388 |
| 1578 | 403.324 |
| 1579 | 423.26 |
| 1580 | 422.196 |
| 1581 | 421.132 |
| 1582 | 420.132 |
| 1583 | 419.132 |
| 1584 | 418.132 |
| 1585 | 417.132 |
| 1586 | 416.132 |
| 1587 | 415.132 |
| 1588 | 414.132 |
| 1589 | 413.132 |
| 1590 | 412.132 |
| 1591 | 411.132 |
| 1592 | 410.102 |
| 1593 | 421.572 |
| 1594 | 420.542 |
| 1595 | 419.512 |
| 1596 | 418.482 |
| 1597 | 417.482 |
| 1598 | 416.482 |
| 1599 | 415.482 |
| 1600 | 414.482 |
| 1601 | 413.482 |
| 1602 | 412.482 |
| 1603 | 411.482 |
| 1604 | 410.482 |
| 1605 | 409.482 |
| 1606 | 408.482 |
| 1607 | 407.482 |
| 1608 | 406.482 |
| 1609 | 405.482 |
| 1610 | 404.482 |
| 1611 | 403.482 |
| 1612 | 402.482 |
| 1613 | 401.482 |
| 1614 | 400.482 |
| 1615 | 399.482 |
| 1616 | 398.482 |
| 1617 | 397.458 |
| 1618 | 396.434 |
| 1619 | 406.41 |
| 1620 | 405.386 |
| 1621 | 404.362 |
| 1622 | 403.362 |
| 1623 | 402.362 |
| 1624 | 401.362 |
| 1625 | 400.362 |
| 1626 | 399.362 |
| 1627 | 398.362 |
| 1628 | 397.362 |
| 1629 | 396.362 |
| 1630 | 395.362 |
| 1631 | 394.362 |
| 1632 | 393.362 |
| 1633 | 392.362 |
| 1634 | 391.362 |
| 1635 | 394.342 |
| 1636 | 393.322 |
| 1637 | 392.322 |
| 1638 | 391.322 |
| 1639 | 390.322 |
| 1640 | 389.322 |
| 1641 | 388.322 |
| 1642 | 387.322 |
| 1643 | 386.322 |
| 1644 | 385.322 |
| 1645 | 384.322 |
| 1646 | 383.322 |
| 1647 | 382.322 |
| 1648 | 381.322 |
| 1649 | 380.322 |
| 1650 | 379.322 |
| 1651 | 378.322 |
| 1652 | 377.322 |
| 1653 | 376.322 |
| 1654 | 375.322 |
| 1655 | 374.322 |
| 1656 | 373.322 |
| 1657 | 372.322 |
| 1658 | 371.322 |
| 1659 | 370.322 |
| 1660 | 369.322 |
| 1661 | 368.322 |
| 1662 | 367.322 |
| 1663 | 366.322 |
| 1664 | 365.322 |
| 1665 | 364.322 |
| 1666 | 363.322 |
| 1667 | 369.314 |
| 1668 | 368.306 |
| 1669 | 367.298 |
| 1670 | 366.29 |
| 1671 | 365.282 |
| 1672 | 364.282 |
| 1673 | 363.282 |
| 1674 | 362.282 |
| 1675 | 361.282 |
| 1676 | 360.282 |
| 1677 | 359.282 |
| 1678 | 358.282 |
| 1679 | 357.222 |
| 1680 | 363.962 |
| 1681 | 362.962 |
| 1682 | 361.962 |
| 1683 | 360.962 |
| 1684 | 359.962 |
| 1685 | 358.962 |
| 1686 | 357.898 |
| 1687 | 356.834 |
| 1688 | 355.77 |
| 1689 | 375.706 |
| 1690 | 374.642 |
| 1691 | 373.642 |
| 1692 | 372.642 |
| 1693 | 371.642 |
| 1694 | 370.642 |
| 1695 | 369.642 |
| 1696 | 368.642 |
| 1697 | 367.642 |
| 1698 | 366.642 |
| 1699 | 365.642 |
| 1700 | 364.642 |
| 1701 | 363.642 |
| 1702 | 362.642 |
| 1703 | 361.642 |
| 1704 | 360.642 |
| 1705 | 359.642 |
| 1706 | 358.642 |
| 1707 | 357.642 |
| 1708 | 356.642 |
| 1709 | 355.642 |
| 1710 | 354.61 |
| 1711 | 353.578 |
| 1712 | 365.546 |
| 1713 | 364.514 |
| 1714 | 363.482 |
| 1715 | 362.232 |
| 1716 | 387.982 |
| 1717 | 386.982 |
| 1718 | 385.982 |
| 1719 | 384.982 |
| 1720 | 383.982 |
| 1721 | 382.982 |
| 1722 | 381.982 |
| 1723 | 380.982 |
| 1724 | 379.982 |
| 1725 | 378.982 |
| 1726 | 377.982 |
| 1727 | 376.982 |
| 1728 | 375.982 |
| 1729 | 374.982 |
| 1730 | 373.982 |
| 1731 | 372.982 |
| 1732 | 371.982 |
| 1733 | 370.982 |
| 1734 | 369.982 |
| 1735 | 368.982 |
| 1736 | 367.982 |
| 1737 | 366.982 |
| 1738 | 365.982 |
| 1739 | 364.982 |
| 1740 | 363.982 |
| 1741 | 362.982 |
| 1742 | 361.982 |
| 1743 | 360.982 |
| 1744 | 359.982 |
| 1745 | 358.982 |
| 1746 | 357.982 |
| 1747 | 356.982 |
| 1748 | 355.982 |
| 1749 | 354.982 |
| 1750 | 353.982 |
| 1751 | 352.982 |
| 1752 | 351.982 |
| 1753 | 350.982 |
| 1754 | 349.982 |
| 1755 | 348.94 |
| 1756 | 360.397 |
| 1757 | 359.354 |
| 1758 | 358.312 |
| 1759 | 357.312 |
| 1760 | 356.312 |
| 1761 | 355.312 |
| 1762 | 354.312 |
| 1763 | 353.312 |
| 1764 | 362.79 |
| 1765 | 361.768 |
| 1766 | 360.746 |
| 1767 | 359.724 |
| 1768 | 358.702 |
| 1769 | 357.702 |
| 1770 | 356.702 |
| 1771 | 355.702 |
| 1772 | 354.702 |
| 1773 | 353.702 |
| 1774 | 352.702 |
| 1775 | 351.702 |
| 1776 | 350.702 |
| 1777 | 356.296 |
| 1778 | 355.29 |
| 1779 | 354.284 |
| 1780 | 353.278 |
| 1781 | 352.272 |
| 1782 | 355.77 |
| 1783 | 354.767 |
| 1784 | 353.764 |
| 1785 | 352.762 |
| 1786 | 351.762 |
| 1787 | 350.762 |
| 1788 | 349.762 |
| 1789 | 348.762 |
| 1790 | 347.762 |
| 1791 | 346.714 |
| 1792 | 345.667 |
| 1793 | 358.12 |
| 1794 | 357.072 |
| 1795 | 356.072 |
| 1796 | 355.072 |
| 1797 | 354.072 |
| 1798 | 353.072 |
| 1799 | 352.072 |
| 1800 | 351.072 |
| 1801 | 350.072 |
| 1802 | 349.072 |
| 1803 | 348.072 |
| 1804 | 347.072 |
| 1805 | 346.032 |
| 1806 | 344.992 |
| 1807 | 343.952 |
| 1808 | 357.912 |
| 1809 | 356.872 |
| 1810 | 355.812 |
| 1811 | 354.752 |
| 1812 | 353.692 |
| 1813 | 352.632 |
| 1814 | 371.572 |
| 1815 | 370.572 |
| 1816 | 369.572 |
| 1817 | 368.572 |
| 1818 | 367.572 |
| 1819 | 372.568 |
| 1820 | 371.564 |
| 1821 | 370.56 |
| 1822 | 369.556 |
| 1823 | 368.552 |
| 1824 | 367.48 |
| 1825 | 366.408 |
| 1826 | 365.336 |
| 1827 | 387.264 |
| 1828 | 386.192 |
| 1829 | 385.192 |
| 1830 | 384.192 |
| 1831 | 383.192 |
| 1832 | 382.192 |
| 1833 | 381.192 |
| 1834 | 388.976 |
| 1835 | 387.96 |
| 1836 | 386.944 |
| 1837 | 385.928 |
| 1838 | 384.912 |
| 1839 | 383.912 |
| 1840 | 382.912 |
| 1841 | 381.912 |
| 1842 | 380.912 |
| 1843 | 379.912 |
| 1844 | 378.886 |
| 1845 | 389.36 |
| 1846 | 388.334 |
| 1847 | 387.308 |
| 1848 | 386.282 |
| 1849 | 394.066 |
| 1850 | 393.05 |
| 1851 | 392.034 |
| 1852 | 391.018 |
| 1853 | 390.002 |
| 1854 | 389.002 |
| 1855 | 388.002 |
| 1856 | 387.002 |
| 1857 | 386.002 |
| 1858 | 385.002 |
| 1859 | 384.002 |
| 1860 | 383.002 |
| 1861 | 382.002 |
| 1862 | 381.002 |
| 1863 | 380.002 |
| 1864 | 379.002 |
| 1865 | 378.002 |
| 1866 | 377.002 |
| 1867 | 376.002 |
| 1868 | 375.002 |
| 1869 | 374.002 |
| 1870 | 373.002 |
| 1871 | 372.002 |
| 1872 | 371.002 |
| 1873 | 370.002 |
| 1874 | 369.002 |
| 1875 | 368.002 |
| 1876 | 367.002 |
| 1877 | 366.002 |
| 1878 | 365.002 |
| 1879 | 364.002 |
| 1880 | 363.002 |
| 1881 | 362.002 |
| 1882 | 361.002 |
| 1883 | 360.002 |
| 1884 | 358.958 |
| 1885 | 357.914 |
| 1886 | 372.87 |
| 1887 | 371.826 |
| 1888 | 370.782 |
| 1889 | 369.782 |
| 1890 | 368.782 |
| 1891 | 367.782 |
| 1892 | 366.782 |
| 1893 | 365.782 |
| 1894 | 364.756 |
| 1895 | 363.73 |
| 1896 | 374.204 |
| 1897 | 373.178 |
| 1898 | 372.152 |
| 1899 | 371.077 |
| 1900 | 379.402 |
| 1901 | 378.402 |
| 1902 | 377.402 |
| 1903 | 376.402 |
| 1904 | 375.402 |
| 1905 | 374.402 |
| 1906 | 373.402 |
| 1907 | 372.402 |
| 1908 | 371.402 |
| 1909 | 370.402 |
| 1910 | 375.996 |
| 1911 | 374.99 |
| 1912 | 373.984 |
| 1913 | 372.978 |
| 1914 | 371.972 |
| 1915 | 370.972 |
| 1916 | 369.972 |
| 1917 | 368.972 |
| 1918 | 367.972 |
| 1919 | 366.972 |
| 1920 | 365.972 |
| 1921 | 364.972 |
| 1922 | 368.462 |
| 1923 | 367.452 |
| 1924 | 366.442 |
| 1925 | 365.392 |
| 1926 | 364.342 |
| 1927 | 377.292 |
| 1928 | 376.242 |
| 1929 | 375.242 |
| 1930 | 374.242 |
| 1931 | 373.242 |
| 1932 | 372.242 |
| 1933 | 371.242 |
| 1934 | 370.242 |
| 1935 | 369.242 |
| 1936 | 368.242 |
| 1937 | 367.242 |
| 1938 | 366.242 |
| 1939 | 365.242 |
| 1940 | 364.242 |
| 1941 | 363.242 |
| 1942 | 362.242 |
| 1943 | 361.242 |
| 1944 | 360.242 |
| 1945 | 359.242 |
| 1946 | 358.242 |
| 1947 | 367.212 |
| 1948 | 366.182 |
| 1949 | 365.152 |
| 1950 | 364.122 |
| 1951 | 368.918 |
| 1952 | 367.914 |
| 1953 | 366.91 |
| 1954 | 365.906 |
| 1955 | 364.902 |
| 1956 | 363.902 |
| 1957 | 362.902 |
| 1958 | 361.902 |
| 1959 | 360.902 |
| 1960 | 359.902 |
| 1961 | 358.902 |
| 1962 | 357.902 |
| 1963 | 356.902 |
| 1964 | 355.902 |
| 1965 | 354.902 |
| 1966 | 353.902 |
| 1967 | 352.902 |
| 1968 | 351.902 |
| 1969 | 350.902 |
| 1970 | 349.805 |
| 1971 | 366.209 |
| 1972 | 365.112 |
| 1973 | 364.112 |
| 1974 | 363.112 |
| 1975 | 362.112 |
| 1976 | 361.112 |
| 1977 | 360.112 |
| 1978 | 359.112 |
| 1979 | 358.112 |
| 1980 | 357.112 |
| 1981 | 356.112 |
| 1982 | 355.068 |
| 1983 | 354.024 |
| 1984 | 368.98 |
| 1985 | 367.936 |
| 1986 | 366.892 |
| 1987 | 365.892 |
| 1988 | 364.892 |
| 1989 | 363.892 |
| 1990 | 362.892 |
| 1991 | 361.892 |
| 1992 | 360.892 |
| 1993 | 359.892 |
| 1994 | 358.892 |
| 1995 | 357.892 |
| 1996 | 356.892 |
| 1997 | 355.892 |
| 1998 | 354.892 |
| 1999 | 361.859 |
| 2000 | 360.825 |
| 2001 | 359.792 |
| 2002 | 358.792 |
| 2003 | 357.792 |
| 2004 | 356.792 |
| 2005 | 355.792 |
| 2006 | 354.792 |
| 2007 | 353.792 |
| 2008 | 352.792 |
| 2009 | 351.792 |
| 2010 | 350.792 |
| 2011 | 349.792 |
| 2012 | 348.792 |
| 2013 | 347.792 |
| 2014 | 346.792 |
| 2015 | 345.792 |
| 2016 | 344.792 |
| 2017 | 343.792 |
| 2018 | 342.75 |
| 2019 | 341.708 |
| 2020 | 356.166 |
| 2021 | 355.124 |
| 2022 | 354.082 |
| 2023 | 353.082 |
| 2024 | 352.082 |
| 2025 | 351.082 |
| 2026 | 350.082 |
| 2027 | 349.082 |
| 2028 | 348.082 |
| 2029 | 347.082 |
| 2030 | 346.082 |
| 2031 | 357.519 |
| 2032 | 356.455 |
| 2033 | 355.392 |
| 2034 | 354.392 |
| 2035 | 353.392 |
| 2036 | 352.392 |
| 2037 | 351.392 |
| 2038 | 350.392 |
| 2039 | 355.769 |
| 2040 | 354.745 |
| 2041 | 353.722 |
| 2042 | 357.822 |
| 2043 | 356.822 |
| 2044 | 355.822 |
| 2045 | 354.822 |
| 2046 | 353.822 |
| 2047 | 362.179 |
| 2048 | 361.135 |
| 2049 | 360.092 |
| 2050 | 359.029 |
| 2051 | 370.465 |
| 2052 | 369.402 |
| 2053 | 368.35 |
| 2054 | 367.298 |
| 2055 | 366.246 |
| 2056 | 383.194 |
| 2057 | 382.142 |
| 2058 | 381.142 |
| 2059 | 380.142 |
| 2060 | 379.142 |
| 2061 | 378.142 |
| 2062 | 377.142 |
| 2063 | 376.142 |
| 2064 | 375.142 |
| 2065 | 374.142 |
| 2066 | 373.142 |
| 2067 | 372.142 |
| 2068 | 371.142 |
| 2069 | 370.142 |
| 2070 | 369.142 |
| 2071 | 368.142 |
| 2072 | 367.142 |
| 2073 | 366.142 |
| 2074 | 365.142 |
| 2075 | 364.142 |
| 2076 | 363.142 |
| 2077 | 362.142 |
| 2078 | 361.142 |
| 2079 | 360.142 |
| 2080 | 359.142 |
| 2081 | 358.142 |
| 2082 | 357.142 |
| 2083 | 356.142 |
| 2084 | 355.142 |
| 2085 | 354.142 |
| 2086 | 358.44 |
| 2087 | 357.438 |
| 2088 | 356.436 |
| 2089 | 355.434 |
| 2090 | 354.432 |
| 2091 | 353.432 |
| 2092 | 352.432 |
| 2093 | 351.36 |
| 2094 | 350.287 |
| 2095 | 367.714 |
| 2096 | 366.642 |
| 2097 | 370.437 |
| 2098 | 369.432 |
| 2099 | 368.427 |
| 2100 | 367.422 |
| 2101 | 366.422 |
| 2102 | 365.422 |
| 2103 | 364.422 |
| 2104 | 363.422 |
| 2105 | 362.422 |
| 2106 | 361.422 |
| 2107 | 360.422 |
| 2108 | 359.422 |
| 2109 | 358.372 |
| 2110 | 357.322 |
| 2111 | 373.772 |
| 2112 | 372.722 |
| 2113 | 371.672 |
| 2114 | 370.672 |
| 2115 | 369.672 |
| 2116 | 368.672 |
| 2117 | 367.672 |
| 2118 | 374.254 |
| 2119 | 373.237 |
| 2120 | 372.22 |
| 2121 | 371.202 |
| 2122 | 370.202 |
| 2123 | 369.202 |
| 2124 | 368.202 |
| 2125 | 367.202 |
| 2126 | 366.202 |
| 2127 | 365.202 |
| 2128 | 364.202 |
| 2129 | 367.102 |
| 2130 | 366.102 |
| 2131 | 365.102 |
| 2132 | 364.102 |
| 2133 | 363.102 |
| 2134 | 369.492 |
| 2135 | 368.482 |
| 2136 | 367.472 |
| 2137 | 366.462 |
| 2138 | 365.452 |
| 2139 | 364.44 |
| 2140 | 370.027 |
| 2141 | 369.014 |
| 2142 | 368.002 |
| 2143 | 367.002 |
| 2144 | 366.002 |
| 2145 | 365.002 |
| 2146 | 364.002 |
| 2147 | 363.002 |
| 2148 | 362.002 |
| 2149 | 361.002 |
| 2150 | 360.002 |
| 2151 | 359.002 |
| 2152 | 358.002 |
| 2153 | 357.002 |
| 2154 | 356.002 |
| 2155 | 354.889 |
| 2156 | 353.775 |
| 2157 | 372.662 |
| 2158 | 381.044 |
| 2159 | 380.026 |
| 2160 | 379.008 |
| 2161 | 377.99 |
| 2162 | 376.972 |
| 2163 | 375.968 |
| 2164 | 381.164 |
| 2165 | 380.16 |
| 2166 | 379.156 |
| 2167 | 378.152 |
| 2168 | 377.136 |
| 2169 | 385.32 |
| 2170 | 384.304 |
| 2171 | 383.288 |
| 2172 | 382.272 |
| 2173 | 381.272 |
| 2174 | 380.272 |
| 2175 | 379.272 |
| 2176 | 378.272 |
| 2177 | 385.807 |
| 2178 | 384.742 |
| 2179 | 383.742 |
| 2180 | 382.742 |
| 2181 | 381.742 |
| 2182 | 380.742 |
| 2183 | 379.742 |
| 2184 | 378.742 |
| 2185 | 377.742 |
| 2186 | 376.742 |
| 2187 | 375.742 |
| 2188 | 374.742 |
| 2189 | 373.742 |
| 2190 | 372.742 |
| 2191 | 371.742 |
| 2192 | 370.742 |
| 2193 | 369.742 |
| 2194 | 368.742 |
| 2195 | 367.726 |
| 2196 | 375.91 |
| 2197 | 374.894 |
| 2198 | 373.878 |
| 2199 | 372.862 |
| 2200 | 371.862 |
| 2201 | 370.862 |
| 2202 | 369.862 |
| 2203 | 368.862 |
| 2204 | 367.862 |
| 2205 | 366.862 |
| 2206 | 365.862 |
| 2207 | 364.862 |
| 2208 | 363.862 |
| 2209 | 362.862 |
| 2210 | 361.862 |
| 2211 | 360.862 |
| 2212 | 359.862 |
| 2213 | 358.862 |
| 2214 | 357.862 |
| 2215 | 362.345 |
| 2216 | 361.329 |
| 2217 | 360.312 |
| 2218 | 359.27 |
| 2219 | 358.228 |
| 2220 | 372.686 |
| 2221 | 371.644 |
| 2222 | 370.602 |
| 2223 | 369.602 |
| 2224 | 368.602 |
| 2225 | 374.196 |
| 2226 | 373.19 |
| 2227 | 372.184 |
| 2228 | 371.178 |
| 2229 | 370.172 |
| 2230 | 369.172 |
| 2231 | 368.172 |
| 2232 | 367.172 |
| 2233 | 366.172 |
| 2234 | 365.172 |
| 2235 | 364.152 |
| 2236 | 372.932 |
| 2237 | 371.912 |
| 2238 | 370.892 |
| 2239 | 369.872 |
| 2240 | 368.872 |
| 2241 | 367.872 |
| 2242 | 366.872 |
| 2243 | 365.872 |
| 2244 | 364.872 |
| 2245 | 363.872 |
| 2246 | 362.872 |
| 2247 | 361.872 |
| 2248 | 360.872 |
| 2249 | 359.872 |
| 2250 | 358.856 |
| 2251 | 367.04 |
| 2252 | 366.024 |
| 2253 | 365.008 |
| 2254 | 363.992 |
| 2255 | 362.96 |
| 2256 | 361.928 |
| 2257 | 360.896 |
| 2258 | 372.864 |
| 2259 | 371.832 |
| 2260 | 370.832 |
| 2261 | 369.832 |
| 2262 | 368.832 |
| 2263 | 367.832 |
| 2264 | 366.832 |
| 2265 | 365.832 |
| 2266 | 364.832 |
| 2267 | 363.832 |
| 2268 | 362.832 |
| 2269 | 361.832 |
| 2270 | 360.832 |
| 2271 | 359.832 |
| 2272 | 358.832 |
| 2273 | 357.832 |
| 2274 | 356.832 |
| 2275 | 355.832 |
| 2276 | 354.832 |
| 2277 | 353.832 |
| 2278 | 352.832 |
| 2279 | 351.832 |
| 2280 | 350.832 |
| 2281 | 349.832 |
| 2282 | 348.832 |
| 2283 | 347.832 |
| 2284 | 346.832 |
| 2285 | 345.832 |
| 2286 | 344.82 |
| 2287 | 350.407 |
| 2288 | 349.394 |
| 2289 | 348.382 |
| 2290 | 347.362 |
| 2291 | 346.342 |
| 2292 | 355.322 |
| 2293 | 354.302 |
| 2294 | 353.282 |
| 2295 | 352.228 |
| 2296 | 351.174 |
| 2297 | 350.12 |
| 2298 | 367.566 |
| 2299 | 366.512 |
| 2300 | 365.279 |
| 2301 | 364.045 |
| 2302 | 400.812 |
| 2303 | 399.812 |
| 2304 | 398.812 |
| 2305 | 397.812 |
| 2306 | 396.812 |
| 2307 | 395.812 |
| 2308 | 394.812 |
| 2309 | 393.812 |
| 2310 | 392.768 |
| 2311 | 391.724 |
| 2312 | 390.68 |
| 2313 | 405.636 |
| 2314 | 404.592 |
| 2315 | 403.592 |
| 2316 | 402.592 |
| 2317 | 401.592 |
| 2318 | 400.465 |
| 2319 | 421.339 |
| 2320 | 420.212 |
| 2321 | 419.212 |
| 2322 | 418.212 |
| 2323 | 417.212 |
| 2324 | 416.212 |
| 2325 | 415.212 |
| 2326 | 414.192 |
| 2327 | 419.372 |
| 2328 | 418.352 |
| 2329 | 417.352 |
| 2330 | 416.352 |
| 2331 | 415.352 |
| 2332 | 414.352 |
| 2333 | 413.352 |
| 2334 | 412.352 |
| 2335 | 411.352 |
| 2336 | 410.352 |
| 2337 | 409.352 |
| 2338 | 408.352 |
| 2339 | 407.352 |
| 2340 | 410.452 |
| 2341 | 409.452 |
| 2342 | 408.452 |
| 2343 | 407.452 |
| 2344 | 406.418 |
| 2345 | 405.384 |
| 2346 | 417.85 |
| 2347 | 416.816 |
| 2348 | 415.782 |
| 2349 | 414.782 |
| 2350 | 413.782 |
| 2351 | 412.782 |
| 2352 | 411.782 |
| 2353 | 410.782 |
| 2354 | 417.57 |
| 2355 | 416.558 |
| 2356 | 415.546 |
| 2357 | 414.534 |
| 2358 | 413.522 |
| 2359 | 412.458 |
| 2360 | 411.394 |
| 2361 | 410.33 |
| 2362 | 430.266 |
| 2363 | 429.202 |
| 2364 | 428.202 |
| 2365 | 427.202 |
| 2366 | 426.162 |
| 2367 | 425.122 |
| 2368 | 439.082 |
| 2369 | 438.042 |
| 2370 | 437.002 |
| 2371 | 442.162 |
| 2372 | 441.122 |
| 2373 | 444.62 |
| 2374 | 443.617 |
| 2375 | 442.614 |
| 2376 | 441.612 |
| 2377 | 440.612 |
| 2378 | 439.612 |
| 2379 | 438.612 |
| 2380 | 437.612 |
| 2381 | 436.612 |
| 2382 | 435.612 |
| 2383 | 434.612 |
| 2384 | 433.612 |
| 2385 | 432.612 |
| 2386 | 431.502 |
| 2387 | 430.392 |
| 2388 | 429.282 |
| 2389 | 454.172 |
| 2390 | 453.172 |
| 2391 | 452.172 |
| 2392 | 451.172 |
| 2393 | 450.172 |
| 2394 | 449.172 |
| 2395 | 448.172 |
| 2396 | 447.172 |
| 2397 | 446.172 |
| 2398 | 445.128 |
| 2399 | 444.084 |
| 2400 | 443.04 |
| 2401 | 457.996 |
| 2402 | 456.952 |
| 2403 | 455.952 |
| 2404 | 454.952 |
| 2405 | 453.952 |
| 2406 | 452.952 |
| 2407 | 451.952 |
| 2408 | 450.952 |
| 2409 | 449.952 |
| 2410 | 448.952 |
| 2411 | 447.952 |
| 2412 | 446.952 |
| 2413 | 445.952 |
| 2414 | 444.952 |
| 2415 | 443.952 |
| 2416 | 442.952 |
| 2417 | 441.952 |
| 2418 | 440.952 |
| 2419 | 439.952 |
| 2420 | 448.928 |
| 2421 | 447.904 |
| 2422 | 446.88 |
| 2423 | 445.856 |
| 2424 | 444.856 |
| 2425 | 443.856 |
| 2426 | 442.856 |
| 2427 | 449.426 |
| 2428 | 448.396 |
| 2429 | 447.366 |
| 2430 | 446.366 |
| 2431 | 445.366 |
| 2432 | 444.366 |
| 2433 | 443.366 |
| 2434 | 442.366 |
| 2435 | 441.366 |
| 2436 | 440.366 |
| 2437 | 439.366 |
| 2438 | 438.366 |
| 2439 | 437.366 |
| 2440 | 436.366 |
| 2441 | 435.366 |
| 2442 | 434.298 |
| 2443 | 433.23 |
| 2444 | 432.162 |
| 2445 | 431.094 |
| 2446 | 452.026 |
| 2447 | 451.026 |
| 2448 | 450.026 |
| 2449 | 449.026 |
| 2450 | 448.026 |
| 2451 | 447.026 |
| 2452 | 446.026 |
| 2453 | 445.026 |
| 2454 | 443.906 |
| 2455 | 442.786 |
| 2456 | 441.666 |
| 2457 | 468.546 |
| 2458 | 467.546 |
| 2459 | 466.546 |
| 2460 | 465.546 |
| 2461 | 464.546 |
| 2462 | 463.546 |
| 2463 | 462.546 |
| 2464 | 461.546 |
| 2465 | 460.546 |
| 2466 | 459.546 |
| 2467 | 458.546 |
| 2468 | 457.546 |
| 2469 | 456.546 |
| 2470 | 455.336 |
| 2471 | 477.126 |
| 2472 | 476.126 |
| 2473 | 475.126 |
| 2474 | 474.126 |
| 2475 | 473.126 |
| 2476 | 472.126 |
| 2477 | 471.126 |
| 2478 | 470.126 |
| 2479 | 469.126 |
| 2480 | 468.126 |
| 2481 | 475.293 |
| 2482 | 474.259 |
| 2483 | 473.226 |
| 2484 | 484.663 |
| 2485 | 483.599 |
| 2486 | 482.536 |
| 2487 | 486.431 |
| 2488 | 485.426 |
| 2489 | 484.421 |
| 2490 | 483.416 |
| 2491 | 482.416 |
| 2492 | 481.416 |
| 2493 | 480.416 |
| 2494 | 479.416 |
| 2495 | 478.416 |
| 2496 | 477.416 |
| 2497 | 476.408 |
| 2498 | 482.4 |
| 2499 | 481.392 |
| 2500 | 480.384 |
| 2501 | 479.376 |
| 2502 | 478.376 |
| 2503 | 477.376 |
| 2504 | 476.376 |
| 2505 | 475.376 |
| 2506 | 474.376 |
| 2507 | 473.376 |
| 2508 | 472.376 |
| 2509 | 471.376 |
| 2510 | 470.376 |
| 2511 | 469.376 |
| 2512 | 468.376 |
| 2513 | 467.376 |
| 2514 | 466.376 |
| 2515 | 465.376 |
| 2516 | 464.376 |
| 2517 | 463.376 |
| 2518 | 462.376 |
| 2519 | 461.376 |
| 2520 | 460.376 |
| 2521 | 459.376 |
| 2522 | 458.376 |
| 2523 | 457.376 |
| 2524 | 456.376 |
| 2525 | 455.376 |
| 2526 | 454.376 |
| 2527 | 453.376 |
| 2528 | 452.376 |
| 2529 | 451.376 |
| 2530 | 450.376 |
| 2531 | 449.376 |
| 2532 | 448.376 |
| 2533 | 447.376 |
| 2534 | 446.376 |
| 2535 | 445.376 |
| 2536 | 444.376 |
| 2537 | 443.376 |
| 2538 | 442.376 |
| 2539 | 441.376 |
| 2540 | 440.376 |
| 2541 | 439.376 |
| 2542 | 438.376 |
| 2543 | 437.376 |
| 2544 | 436.376 |
| 2545 | 435.376 |
| 2546 | 434.376 |
| 2547 | 433.376 |
| 2548 | 432.376 |
| 2549 | 431.376 |
| 2550 | 430.376 |
| 2551 | 429.376 |
| 2552 | 428.376 |
| 2553 | 427.376 |
| 2554 | 426.376 |
| 2555 | 425.376 |
| 2556 | 424.376 |
| 2557 | 423.376 |
| 2558 | 422.376 |
| 2559 | 421.376 |
| 2560 | 420.376 |
| 2561 | 419.376 |
| 2562 | 418.376 |
| 2563 | 417.376 |
| 2564 | 416.376 |
| 2565 | 415.376 |
| 2566 | 414.368 |
| 2567 | 420.36 |
| 2568 | 419.352 |
| 2569 | 418.344 |
| 2570 | 417.336 |
| 2571 | 416.336 |
| 2572 | 415.336 |
| 2573 | 414.336 |
| 2574 | 413.336 |
| 2575 | 412.336 |
| 2576 | 416.531 |
| 2577 | 415.526 |
| 2578 | 414.521 |
| 2579 | 413.516 |
| 2580 | 412.464 |
| 2581 | 411.412 |
| 2582 | 410.36 |
| 2583 | 409.308 |
| 2584 | 426.256 |
| 2585 | 425.222 |
| 2586 | 424.188 |
| 2587 | 436.654 |
| 2588 | 435.62 |
| 2589 | 434.586 |
| 2590 | 433.586 |
| 2591 | 432.586 |
| 2592 | 431.586 |
| 2593 | 430.586 |
| 2594 | 429.586 |
| 2595 | 436.176 |
| 2596 | 435.166 |
| 2597 | 434.156 |
| 2598 | 433.146 |
| 2599 | 432.136 |
| 2600 | 431.136 |
| 2601 | 430.136 |
| 2602 | 429.136 |
| 2603 | 428.136 |
| 2604 | 427.136 |
| 2605 | 426.136 |
| 2606 | 425.136 |
| 2607 | 424.136 |
| 2608 | 423.136 |
| 2609 | 422.136 |
| 2610 | 421.136 |
| 2611 | 435.056 |
| 2612 | 433.976 |
| 2613 | 432.896 |
| 2614 | 431.896 |
| 2615 | 430.896 |
| 2616 | 429.896 |
| 2617 | 428.896 |
| 2618 | 427.856 |
| 2619 | 435.616 |
| 2620 | 434.576 |
| 2621 | 433.501 |
| 2622 | 432.426 |
| 2623 | 450.351 |
| 2624 | 449.276 |
| 2625 | 448.276 |
| 2626 | 447.276 |
| 2627 | 446.276 |
| 2628 | 445.276 |
| 2629 | 451.061 |
| 2630 | 450.046 |
| 2631 | 449.031 |
| 2632 | 448.016 |
| 2633 | 447.016 |
| 2634 | 446.016 |
| 2635 | 445.016 |
| 2636 | 444.016 |
| 2637 | 443.016 |
| 2638 | 442.016 |
| 2639 | 441.016 |
| 2640 | 440.016 |
| 2641 | 439.016 |
| 2642 | 438.016 |
| 2643 | 441.316 |
| 2644 | 440.316 |
| 2645 | 439.316 |
| 2646 | 438.316 |
| 2647 | 437.316 |
| 2648 | 436.316 |
| 2649 | 435.316 |
| 2650 | 434.316 |
| 2651 | 433.316 |
| 2652 | 432.316 |
| 2653 | 431.316 |
| 2654 | 430.316 |
| 2655 | 429.316 |
| 2656 | 428.316 |
| 2657 | 431.914 |
| 2658 | 430.911 |
| 2659 | 429.909 |
| 2660 | 428.906 |
| 2661 | 427.872 |
| 2662 | 426.838 |
| 2663 | 439.304 |
| 2664 | 438.27 |
| 2665 | 437.236 |
| 2666 | 436.236 |
| 2667 | 435.236 |
| 2668 | 442.814 |
| 2669 | 441.791 |
| 2670 | 440.769 |
| 2671 | 439.746 |
| 2672 | 438.746 |
| 2673 | 437.746 |
| 2674 | 436.746 |
| 2675 | 435.746 |
| 2676 | 434.746 |
| 2677 | 433.746 |
| 2678 | 432.746 |
| 2679 | 431.746 |
| 2680 | 430.746 |
| 2681 | 429.706 |
| 2682 | 428.666 |
| 2683 | 436.626 |
| 2684 | 435.626 |
| 2685 | 434.626 |
| 2686 | 433.626 |
| 2687 | 432.626 |
| 2688 | 431.626 |
| 2689 | 430.569 |
| 2690 | 429.511 |
| 2691 | 443.954 |
| 2692 | 442.896 |
| 2693 | 441.874 |
| 2694 | 440.851 |
| 2695 | 448.229 |
| 2696 | 447.206 |
| 2697 | 446.206 |
| 2698 | 445.206 |
| 2699 | 444.206 |
| 2700 | 443.206 |
| 2701 | 442.206 |
| 2702 | 441.206 |
| 2703 | 440.206 |
| 2704 | 439.206 |
| 2705 | 438.206 |
| 2706 | 437.206 |
| 2707 | 441.401 |
| 2708 | 440.396 |
| 2709 | 439.391 |
| 2710 | 438.386 |
| 2711 | 443.366 |
| 2712 | 442.346 |
| 2713 | 441.326 |
| 2714 | 440.326 |
| 2715 | 439.326 |
| 2716 | 438.326 |
| 2717 | 437.326 |
| 2718 | 436.326 |
| 2719 | 435.326 |
| 2720 | 434.326 |
| 2721 | 433.326 |
| 2722 | 443.302 |
| 2723 | 442.278 |
| 2724 | 441.254 |
| 2725 | 440.23 |
| 2726 | 439.206 |
| 2727 | 438.206 |
| 2728 | 437.206 |
| 2729 | 436.206 |
| 2730 | 435.206 |
| 2731 | 441.796 |
| 2732 | 440.786 |
| 2733 | 439.776 |
| 2734 | 438.766 |
| 2735 | 437.756 |
| 2736 | 436.756 |
| 2737 | 435.756 |
| 2738 | 434.756 |
| 2739 | 433.756 |
| 2740 | 432.756 |
| 2741 | 431.756 |
| 2742 | 430.756 |
| 2743 | 429.756 |
| 2744 | 428.756 |
| 2745 | 427.756 |
| 2746 | 426.756 |
| 2747 | 425.756 |
| 2748 | 424.756 |
| 2749 | 423.756 |
| 2750 | 422.756 |
| 2751 | 421.756 |
| 2752 | 420.756 |
| 2753 | 419.698 |
| 2754 | 418.64 |
| 2755 | 437.082 |
| 2756 | 436.024 |
| 2757 | 434.966 |
| 2758 | 433.966 |
| 2759 | 432.966 |
| 2760 | 431.966 |
| 2761 | 430.966 |
| 2762 | 429.966 |
| 2763 | 428.966 |
| 2764 | 427.966 |
| 2765 | 426.966 |
| 2766 | 425.966 |
| 2767 | 435.876 |
| 2768 | 434.786 |
| 2769 | 433.786 |
| 2770 | 432.786 |
| 2771 | 431.786 |
| 2772 | 430.786 |
| 2773 | 429.786 |
| 2774 | 428.714 |
| 2775 | 427.642 |
| 2776 | 426.57 |
| 2777 | 425.498 |
| 2778 | 447.426 |
| 2779 | 446.426 |
| 2780 | 445.426 |
| 2781 | 444.426 |
| 2782 | 443.426 |
| 2783 | 442.426 |
| 2784 | 441.386 |
| 2785 | 440.346 |
| 2786 | 451.306 |
| 2787 | 450.266 |
| 2788 | 449.266 |
| 2789 | 448.266 |
| 2790 | 447.266 |
| 2791 | 446.246 |
| 2792 | 451.226 |
| 2793 | 450.206 |
| 2794 | 449.206 |
| 2795 | 448.206 |
| 2796 | 447.206 |
| 2797 | 446.206 |
| 2798 | 445.206 |
| 2799 | 454.621 |
| 2800 | 453.536 |
| 2801 | 452.536 |
| 2802 | 451.536 |
| 2803 | 450.472 |
| 2804 | 449.408 |
| 2805 | 448.344 |
| 2806 | 468.28 |
| 2807 | 467.216 |
| 2808 | 466.202 |
| 2809 | 473.588 |
| 2810 | 472.574 |
| 2811 | 471.56 |
| 2812 | 470.546 |
| 2813 | 476.936 |
| 2814 | 475.926 |
| 2815 | 474.916 |
| 2816 | 473.906 |
| 2817 | 472.896 |
| 2818 | 471.896 |
| 2819 | 470.896 |
| 2820 | 469.896 |
| 2821 | 468.896 |
| 2822 | 467.896 |
| 2823 | 472.886 |
| 2824 | 471.876 |
| 2825 | 470.866 |
| 2826 | 469.856 |
| 2827 | 468.828 |
| 2828 | 467.8 |
| 2829 | 478.772 |
| 2830 | 477.744 |
| 2831 | 476.716 |
| 2832 | 475.716 |
| 2833 | 474.716 |
| 2834 | 479.706 |
| 2835 | 478.696 |
| 2836 | 477.686 |
| 2837 | 476.676 |
| 2838 | 480.663 |
| 2839 | 479.649 |
| 2840 | 478.636 |
| 2841 | 477.636 |
| 2842 | 476.636 |
| 2843 | 475.636 |
| 2844 | 474.636 |
| 2845 | 473.636 |
| 2846 | 472.636 |
| 2847 | 471.636 |
| 2848 | 470.636 |
| 2849 | 469.636 |
| 2850 | 468.636 |
| 2851 | 467.636 |
| 2852 | 466.636 |
| 2853 | 465.636 |
| 2854 | 464.636 |
| 2855 | 463.636 |
| 2856 | 462.636 |
| 2857 | 461.636 |
| 2858 | 460.636 |
| 2859 | 459.636 |
| 2860 | 458.636 |
| 2861 | 457.636 |
| 2862 | 456.636 |
| 2863 | 455.636 |
| 2864 | 454.636 |
| 2865 | 453.636 |
| 2866 | 452.636 |
| 2867 | 451.636 |
| 2868 | 450.636 |
| 2869 | 449.636 |
| 2870 | 448.636 |
| 2871 | 447.636 |
| 2872 | 446.636 |
| 2873 | 445.636 |
| 2874 | 444.636 |
| 2875 | 443.636 |
| 2876 | 442.636 |
| 2877 | 441.636 |
| 2878 | 440.636 |
| 2879 | 439.636 |
| 2880 | 438.636 |
| 2881 | 437.636 |
| 2882 | 436.636 |
| 2883 | 435.636 |
| 2884 | 443.566 |
| 2885 | 442.496 |
| 2886 | 441.496 |
| 2887 | 440.496 |
| 2888 | 439.496 |
| 2889 | 438.496 |
| 2890 | 437.496 |
| 2891 | 436.496 |
| 2892 | 435.496 |
| 2893 | 434.496 |
| 2894 | 433.496 |
| 2895 | 432.496 |
| 2896 | 431.496 |
| 2897 | 430.496 |
| 2898 | 429.496 |
| 2899 | 428.496 |
| 2900 | 427.496 |
| 2901 | 426.496 |
| 2902 | 425.496 |
| 2903 | 424.454 |
| 2904 | 423.412 |
| 2905 | 422.37 |
| 2906 | 421.328 |
| 2907 | 435.786 |
| 2908 | 434.786 |
| 2909 | 433.786 |
| 2910 | 437.776 |
| 2911 | 436.766 |
| 2912 | 435.756 |
| 2913 | 434.724 |
| 2914 | 446.692 |
| 2915 | 445.66 |
| 2916 | 444.628 |
| 2917 | 443.596 |
| 2918 | 456.062 |
| 2919 | 455.028 |
| 2920 | 453.994 |
| 2921 | 452.96 |
| 2922 | 451.926 |
| 2923 | 450.821 |
| 2924 | 449.716 |
| 2925 | 448.611 |
| 2926 | 472.506 |
| 2927 | 471.506 |
| 2928 | 470.506 |
| 2929 | 469.506 |
| 2930 | 468.506 |
| 2931 | 467.506 |
| 2932 | 474.294 |
| 2933 | 473.282 |
| 2934 | 472.27 |
| 2935 | 471.258 |
| 2936 | 470.246 |
| 2937 | 469.199 |
| 2938 | 468.153 |
| 2939 | 476.906 |
| 2940 | 475.906 |
| 2941 | 474.906 |
| 2942 | 473.906 |
| 2943 | 472.906 |
| 2944 | 471.906 |
| 2945 | 470.906 |
| 2946 | 469.906 |
| 2947 | 468.906 |
| 2948 | 467.906 |
| 2949 | 466.906 |
| 2950 | 465.906 |
| 2951 | 464.906 |
| 2952 | 463.906 |
| 2953 | 462.906 |
| 2954 | 461.906 |
| 2955 | 460.906 |
| 2956 | 463.886 |
| 2957 | 462.866 |
| 2958 | 461.866 |
| 2959 | 460.866 |
| 2960 | 459.866 |
| 2961 | 458.866 |
| 2962 | 457.866 |
| 2963 | 456.866 |
| 2964 | 455.866 |
| 2965 | 454.866 |
| 2966 | 453.866 |
| 2967 | 452.866 |
| 2968 | 451.866 |
| 2969 | 450.866 |
| 2970 | 449.866 |
| 2971 | 448.866 |
| 2972 | 447.866 |
| 2973 | 446.866 |
| 2974 | 460.328 |
| 2975 | 459.29 |
| 2976 | 458.252 |
| 2977 | 457.214 |
| 2978 | 456.176 |
| 2979 | 455.099 |
| 2980 | 454.023 |
| 2981 | 467.446 |
| 2982 | 477.92 |
| 2983 | 476.894 |
| 2984 | 475.868 |
| 2985 | 474.842 |
| 2986 | 473.816 |
| 2987 | 472.816 |
| 2988 | 471.816 |
| 2989 | 470.816 |
| 2990 | 469.816 |
| 2991 | 468.816 |
| 2992 | 467.816 |
| 2993 | 466.816 |
| 2994 | 465.816 |
| 2995 | 464.816 |
| 2996 | 463.778 |
| 2997 | 462.74 |
| 2998 | 476.202 |
| 2999 | 475.164 |
| 3000 | 474.126 |
| 3001 | 473.126 |
| 3002 | 472.126 |
| 3003 | 471.126 |
| 3004 | 470.126 |
| 3005 | 469.126 |
| 3006 | 468.126 |
| 3007 | 467.126 |
| 3008 | 466.126 |
| 3009 | 465.126 |
| 3010 | 464.126 |
| 3011 | 463.126 |
| 3012 | 462.126 |
| 3013 | 461.126 |
| 3014 | 460.126 |
| 3015 | 463.913 |
| 3016 | 462.899 |
| 3017 | 461.886 |
| 3018 | 460.886 |
| 3019 | 459.886 |
| 3020 | 458.823 |
| 3021 | 470.259 |
| 3022 | 469.196 |
| 3023 | 468.196 |
| 3024 | 467.196 |
| 3025 | 466.196 |
| 3026 | 465.196 |
| 3027 | 464.196 |
| 3028 | 463.134 |
| 3029 | 462.071 |
| 3030 | 477.509 |
| 3031 | 476.446 |
| 3032 | 475.412 |
| 3033 | 487.878 |
| 3034 | 486.844 |
| 3035 | 485.81 |
| 3036 | 484.776 |
| 3037 | 483.739 |
| 3038 | 482.701 |
| 3039 | 493.164 |
| 3040 | 492.126 |
| 3041 | 491.126 |
| 3042 | 490.126 |
| 3043 | 489.126 |
| 3044 | 488.126 |
| 3045 | 487.126 |
| 3046 | 486.126 |
| 3047 | 485.126 |
| 3048 | 484.126 |
| 3049 | 483.126 |
| 3050 | 482.126 |
| 3051 | 481.126 |
| 3052 | 480.126 |
| 3053 | 486.111 |
| 3054 | 485.096 |
| 3055 | 484.081 |
| 3056 | 483.066 |
| 3057 | 482.066 |
| 3058 | 481.066 |
| 3059 | 480.066 |
| 3060 | 479.066 |
| 3061 | 478.066 |
| 3062 | 477.066 |
| 3063 | 476.066 |
| 3064 | 475.066 |
| 3065 | 474.028 |
| 3066 | 472.99 |
| 3067 | 471.952 |
| 3068 | 485.414 |
| 3069 | 484.376 |
| 3070 | 483.376 |
| 3071 | 482.376 |
| 3072 | 481.376 |
| 3073 | 480.376 |
| 3074 | 479.332 |
| 3075 | 478.288 |
| 3076 | 493.244 |
| 3077 | 492.2 |
| 3078 | 491.156 |
| 3079 | 490.086 |
| 3080 | 507.016 |
| 3081 | 505.946 |
| 3082 | 504.876 |
| 3083 | 503.876 |
| 3084 | 502.876 |
| 3085 | 501.876 |
| 3086 | 500.84 |
| 3087 | 499.804 |
| 3088 | 512.768 |
| 3089 | 511.732 |
| 3090 | 510.696 |
| 3091 | 525.139 |
| 3092 | 524.081 |
| 3093 | 523.024 |
| 3094 | 521.966 |
| 3095 | 520.966 |
| 3096 | 519.966 |
| 3097 | 518.966 |
| 3098 | 517.966 |
| 3099 | 516.966 |
| 3100 | 515.966 |
| 3101 | 514.966 |
| 3102 | 513.966 |
| 3103 | 512.966 |
| 3104 | 511.966 |
| 3105 | 510.966 |
| 3106 | 509.966 |
| 3107 | 508.966 |
| 3108 | 507.966 |
| 3109 | 506.966 |
| 3110 | 505.906 |
| 3111 | 512.846 |
| 3112 | 511.846 |
| 3113 | 510.846 |
| 3114 | 518.63 |
| 3115 | 517.614 |
| 3116 | 516.598 |
| 3117 | 515.582 |
| 3118 | 514.566 |
| 3119 | 513.566 |
| 3120 | 512.566 |
| 3121 | 511.566 |
| 3122 | 510.566 |
| 3123 | 509.566 |
| 3124 | 508.566 |
| 3125 | 507.566 |
| 3126 | 506.566 |
| 3127 | 505.566 |
| 3128 | 504.566 |
| 3129 | 503.566 |
| 3130 | 511.939 |
| 3131 | 510.911 |
| 3132 | 509.884 |
| 3133 | 508.856 |
| 3134 | 519.796 |
| 3135 | 518.736 |
| 3136 | 517.676 |
| 3137 | 529.146 |
| 3138 | 528.116 |
| 3139 | 527.086 |
| 3140 | 526.056 |
| 3141 | 525.026 |
| 3142 | 524.026 |
| 3143 | 523.026 |
| 3144 | 522.026 |
| 3145 | 521.026 |
| 3146 | 520.026 |
| 3147 | 519.026 |
| 3148 | 518.026 |
| 3149 | 517.026 |
| 3150 | 516.026 |
| 3151 | 515.026 |
| 3152 | 514.026 |
| 3153 | 513.026 |
| 3154 | 512.026 |
| 3155 | 511.026 |
| 3156 | 509.979 |
| 3157 | 518.933 |
| 3158 | 517.886 |
| 3159 | 516.886 |
| 3160 | 515.886 |
| 3161 | 514.886 |
| 3162 | 513.886 |
| 3163 | 512.886 |
| 3164 | 511.886 |
| 3165 | 510.886 |
| 3166 | 509.886 |
| 3167 | 508.886 |
| 3168 | 507.886 |
| 3169 | 506.886 |
| 3170 | 505.886 |
| 3171 | 504.886 |
| 3172 | 503.859 |
| 3173 | 512.231 |
| 3174 | 511.204 |
| 3175 | 510.176 |
| 3176 | 509.176 |
| 3177 | 508.176 |
| 3178 | 507.176 |
| 3179 | 506.176 |
| 3180 | 505.176 |
| 3181 | 504.176 |
| 3182 | 503.176 |
| 3183 | 502.176 |
| 3184 | 501.154 |
| 3185 | 508.731 |
| 3186 | 507.709 |
| 3187 | 506.686 |
| 3188 | 505.686 |
| 3189 | 504.686 |
| 3190 | 503.686 |
| 3191 | 502.686 |
| 3192 | 501.686 |
| 3193 | 500.686 |
| 3194 | 499.686 |
| 3195 | 498.664 |
| 3196 | 506.041 |
| 3197 | 505.019 |
| 3198 | 503.996 |
| 3199 | 502.996 |
| 3200 | 501.996 |
| 3201 | 500.996 |
| 3202 | 499.996 |
| 3203 | 498.996 |
| 3204 | 497.996 |
| 3205 | 496.996 |
| 3206 | 495.996 |
| 3207 | 494.996 |
| 3208 | 493.966 |
| 3209 | 505.436 |
| 3210 | 504.406 |
| 3211 | 503.376 |
| 3212 | 502.346 |
| 3213 | 501.346 |
| 3214 | 500.346 |
| 3215 | 499.346 |
| 3216 | 498.346 |
| 3217 | 497.346 |
| 3218 | 496.346 |
| 3219 | 495.346 |
| 3220 | 494.346 |
| 3221 | 493.346 |
| 3222 | 492.346 |
| 3223 | 491.346 |
| 3224 | 490.346 |
| 3225 | 489.346 |
| 3226 | 488.346 |
| 3227 | 487.346 |
| 3228 | 486.346 |
| 3229 | 485.346 |
| 3230 | 484.346 |
| 3231 | 483.346 |
| 3232 | 482.346 |
| 3233 | 481.332 |
| 3234 | 488.918 |
| 3235 | 487.904 |
| 3236 | 486.89 |
| 3237 | 485.876 |
| 3238 | 492.068 |
| 3239 | 491.06 |
| 3240 | 490.052 |
| 3241 | 489.044 |
| 3242 | 488.036 |
| 3243 | 490.979 |
| 3244 | 489.973 |
| 3245 | 488.966 |
| 3246 | 487.966 |
| 3247 | 486.966 |
| 3248 | 491.946 |
| 3249 | 490.926 |
| 3250 | 489.906 |
| 3251 | 488.906 |
| 3252 | 487.906 |
| 3253 | 486.906 |
| 3254 | 485.906 |
| 3255 | 484.906 |
| 3256 | 483.906 |
| 3257 | 482.906 |
| 3258 | 481.906 |
| 3259 | 480.906 |
| 3260 | 479.906 |
| 3261 | 478.906 |
| 3262 | 477.906 |
| 3263 | 476.906 |
| 3264 | 475.906 |
| 3265 | 474.906 |
| 3266 | 473.871 |
| 3267 | 472.836 |
| 3268 | 482.801 |
| 3269 | 481.766 |
| 3270 | 480.766 |
| 3271 | 479.766 |
| 3272 | 478.766 |
| 3273 | 477.766 |
| 3274 | 476.766 |
| 3275 | 475.766 |
| 3276 | 474.766 |
| 3277 | 473.766 |
| 3278 | 483.244 |
| 3279 | 482.222 |
| 3280 | 481.2 |
| 3281 | 480.178 |
| 3282 | 479.156 |
| 3283 | 478.156 |
| 3284 | 477.156 |
| 3285 | 476.156 |
| 3286 | 475.156 |
| 3287 | 474.156 |
| 3288 | 473.156 |
| 3289 | 472.156 |
| 3290 | 471.156 |
| 3291 | 470.156 |
| 3292 | 469.156 |
| 3293 | 483.076 |
| 3294 | 481.996 |
| 3295 | 480.916 |
| 3296 | 479.916 |
| 3297 | 478.916 |
| 3298 | 477.916 |
| 3299 | 476.916 |
| 3300 | 475.916 |
| 3301 | 474.916 |
| 3302 | 473.916 |
| 3303 | 472.916 |
| 3304 | 471.916 |
| 3305 | 470.916 |
| 3306 | 469.916 |
| 3307 | 468.916 |
| 3308 | 467.916 |
| 3309 | 466.916 |
| 3310 | 465.916 |
| 3311 | 464.916 |
| 3312 | 463.856 |
| 3313 | 462.796 |
| 3314 | 477.736 |
| 3315 | 476.676 |
| 3316 | 475.676 |
| 3317 | 474.676 |
| 3318 | 473.676 |
| 3319 | 472.676 |
| 3320 | 471.676 |
| 3321 | 470.676 |
| 3322 | 469.676 |
| 3323 | 468.676 |
| 3324 | 467.676 |
| 3325 | 474.656 |
| 3326 | 473.636 |
| 3327 | 472.616 |
| 3328 | 471.596 |
| 3329 | 470.576 |
| 3330 | 477.756 |
| 3331 | 476.736 |
| 3332 | 475.716 |
| 3333 | 474.682 |
| 3334 | 473.648 |
| 3335 | 472.614 |
| 3336 | 485.08 |
| 3337 | 484.046 |
| 3338 | 483.026 |
| 3339 | 492.006 |
| 3340 | 490.986 |
| 3341 | 489.966 |
| 3342 | 488.946 |
| 3343 | 487.946 |
| 3344 | 486.946 |
| 3345 | 485.883 |
| 3346 | 497.319 |
| 3347 | 496.256 |
| 3348 | 495.256 |
| 3349 | 494.256 |
| 3350 | 493.256 |
| 3351 | 492.256 |
| 3352 | 491.256 |
| 3353 | 490.256 |
| 3354 | 489.256 |
| 3355 | 488.256 |
| 3356 | 487.256 |
| 3357 | 486.256 |
| 3358 | 485.256 |
| 3359 | 484.256 |
| 3360 | 483.256 |
| 3361 | 482.256 |
| 3362 | 481.256 |
| 3363 | 480.251 |
| 3364 | 483.851 |
| 3365 | 482.846 |
| 3366 | 481.841 |
| 3367 | 480.841 |
| 3368 | 479.841 |
| 3369 | 478.841 |
| 3370 | 477.841 |
| 3371 | 476.841 |
| 3372 | 475.795 |
| 3373 | 474.749 |
| 3374 | 473.703 |
| 3375 | 489.157 |
| 3376 | 488.111 |
| 3377 | 487.111 |
| 3378 | 486.111 |
| 3379 | 485.111 |
| 3380 | 484.111 |
| 3381 | 483.111 |
| 3382 | 482.051 |
| 3383 | 480.991 |
| 3384 | 479.931 |
| 3385 | 494.871 |
| 3386 | 493.871 |
| 3387 | 492.871 |
| 3388 | 491.871 |
| 3389 | 490.871 |
| 3390 | 489.871 |
| 3391 | 488.871 |
| 3392 | 487.871 |
| 3393 | 486.871 |
| 3394 | 485.871 |
| 3395 | 484.871 |
| 3396 | 483.871 |
| 3397 | 482.871 |
| 3398 | 481.871 |
| 3399 | 485.641 |
| 3400 | 484.611 |
| 3401 | 483.611 |
| 3402 | 482.611 |
| 3403 | 481.611 |
| 3404 | 480.611 |
| 3405 | 479.549 |
| 3406 | 478.486 |
| 3407 | 477.424 |
| 3408 | 492.861 |
| 3409 | 491.861 |
| 3410 | 490.861 |
| 3411 | 489.861 |
| 3412 | 488.861 |
| 3413 | 487.861 |
| 3414 | 486.861 |
| 3415 | 485.861 |
| 3416 | 484.861 |
| 3417 | 483.861 |
| 3418 | 482.861 |
| 3419 | 481.861 |
| 3420 | 480.861 |
| 3421 | 479.861 |
| 3422 | 486.641 |
| 3423 | 485.621 |
| 3424 | 484.601 |
| 3425 | 483.581 |
| 3426 | 482.526 |
| 3427 | 481.471 |
| 3428 | 480.416 |
| 3429 | 494.361 |
| 3430 | 493.361 |
| 3431 | 492.361 |
| 3432 | 491.361 |
| 3433 | 490.361 |
| 3434 | 489.361 |
| 3435 | 488.361 |
| 3436 | 487.361 |
| 3437 | 486.361 |
| 3438 | 485.361 |
| 3439 | 484.361 |
| 3440 | 483.361 |
| 3441 | 482.361 |
| 3442 | 481.361 |
| 3443 | 480.361 |
| 3444 | 479.361 |
| 3445 | 478.361 |
| 3446 | 477.361 |
| 3447 | 476.361 |
| 3448 | 475.361 |
| 3449 | 481.153 |
| 3450 | 480.145 |
| 3451 | 479.137 |
| 3452 | 478.129 |
| 3453 | 477.121 |
| 3454 | 476.121 |
| 3455 | 475.121 |
| 3456 | 474.121 |
| 3457 | 473.121 |
| 3458 | 472.121 |
| 3459 | 471.121 |
| 3460 | 470.121 |
| 3461 | 469.121 |
| 3462 | 468.121 |
| 3463 | 467.121 |
| 3464 | 466.121 |
| 3465 | 465.121 |
| 3466 | 464.121 |
| 3467 | 463.121 |
| 3468 | 462.121 |
| 3469 | 461.121 |
| 3470 | 460.121 |
| 3471 | 459.121 |
| 3472 | 458.121 |
| 3473 | 457.121 |
| 3474 | 456.121 |
| 3475 | 455.121 |
| 3476 | 454.121 |
| 3477 | 453.121 |
| 3478 | 452.121 |
| 3479 | 451.121 |
| 3480 | 450.121 |
| 3481 | 449.121 |
| 3482 | 448.121 |
| 3483 | 447.121 |
| 3484 | 446.121 |
| 3485 | 445.121 |
| 3486 | 444.121 |
| 3487 | 443.121 |
| 3488 | 442.121 |
| 3489 | 441.121 |
| 3490 | 440.121 |
| 3491 | 439.121 |
| 3492 | 438.121 |
| 3493 | 437.121 |
| 3494 | 436.121 |
| 3495 | 435.121 |
| 3496 | 434.121 |
| 3497 | 433.121 |
| 3498 | 432.121 |
| 3499 | 431.121 |
| 3500 | 430.121 |
| 3501 | 429.121 |
| 3502 | 428.121 |
| 3503 | 427.121 |
| 3504 | 426.121 |
| 3505 | 425.121 |
| 3506 | 424.093 |
| 3507 | 423.065 |
| 3508 | 434.037 |
| 3509 | 433.009 |
| 3510 | 431.981 |
| 3511 | 430.981 |
| 3512 | 429.981 |
| 3513 | 428.981 |
| 3514 | 427.981 |
| 3515 | 426.781 |
| 3516 | 447.581 |
| 3517 | 446.581 |
| 3518 | 445.581 |
| 3519 | 444.581 |
| 3520 | 443.581 |
| 3521 | 442.581 |
| 3522 | 447.771 |
| 3523 | 446.761 |
| 3524 | 445.751 |
| 3525 | 444.741 |
| 3526 | 443.741 |
| 3527 | 442.741 |
| 3528 | 441.741 |
| 3529 | 440.741 |
| 3530 | 439.741 |
| 3531 | 438.741 |
| 3532 | 437.741 |
| 3533 | 436.741 |
| 3534 | 435.741 |
| 3535 | 434.741 |
| 3536 | 439.334 |
| 3537 | 438.326 |
| 3538 | 437.319 |
| 3539 | 436.311 |
| 3540 | 440.381 |
| 3541 | 439.351 |
| 3542 | 438.351 |
| 3543 | 437.351 |
| 3544 | 436.351 |
| 3545 | 435.351 |
| 3546 | 434.351 |
| 3547 | 433.351 |
| 3548 | 432.351 |
| 3549 | 431.351 |
| 3550 | 430.351 |
| 3551 | 429.351 |
| 3552 | 428.351 |
| 3553 | 427.351 |
| 3554 | 426.351 |
| 3555 | 425.351 |
| 3556 | 424.351 |
| 3557 | 423.351 |
| 3558 | 429.896 |
| 3559 | 428.841 |
| 3560 | 433.631 |
| 3561 | 432.621 |
| 3562 | 431.611 |
| 3563 | 430.601 |
| 3564 | 429.601 |
| 3565 | 428.601 |
| 3566 | 427.601 |
| 3567 | 426.511 |
| 3568 | 436.421 |
| 3569 | 435.421 |
| 3570 | 434.421 |
| 3571 | 433.421 |
| 3572 | 432.421 |
| 3573 | 431.421 |
| 3574 | 430.421 |
| 3575 | 429.421 |
| 3576 | 428.421 |
| 3577 | 427.421 |
| 3578 | 426.421 |
| 3579 | 425.421 |
| 3580 | 424.421 |
| 3581 | 423.421 |
| 3582 | 422.421 |
| 3583 | 421.421 |
| 3584 | 420.296 |
| 3585 | 419.171 |
| 3586 | 418.046 |
| 3587 | 445.921 |
| 3588 | 444.921 |
| 3589 | 443.921 |
| 3590 | 442.867 |
| 3591 | 441.813 |
| 3592 | 440.759 |
| 3593 | 458.205 |
| 3594 | 457.151 |
| 3595 | 469.581 |
| 3596 | 468.511 |
| 3597 | 467.441 |
| 3598 | 466.441 |
| 3599 | 465.441 |
| 3600 | 464.441 |
| 3601 | 463.441 |
| 3602 | 462.441 |
| 3603 | 466.636 |
| 3604 | 465.631 |
| 3605 | 464.626 |
| 3606 | 463.621 |
| 3607 | 462.553 |
| 3608 | 461.485 |
| 3609 | 460.417 |
| 3610 | 481.349 |
| 3611 | 480.281 |
| 3612 | 479.148 |
| 3613 | 478.014 |
| 3614 | 499.881 |
| 3615 | 507.459 |
| 3616 | 506.436 |
| 3617 | 505.414 |
| 3618 | 504.391 |
| 3619 | 503.301 |
| 3620 | 502.211 |
| 3621 | 517.621 |
| 3622 | 516.621 |
| 3623 | 515.621 |
| 3624 | 514.621 |
| 3625 | 513.621 |
| 3626 | 512.401 |
| 3627 | 535.181 |
| 3628 | 534.181 |
| 3629 | 533.181 |
| 3630 | 532.181 |
| 3631 | 540.311 |
| 3632 | 539.241 |
| 3633 | 538.241 |
| 3634 | 537.241 |
| 3635 | 536.241 |
| 3636 | 535.241 |
| 3637 | 534.071 |
| 3638 | 551.901 |
| 3639 | 555.988 |
| 3640 | 554.974 |
| 3641 | 553.961 |
| 3642 | 552.931 |
| 3643 | 551.901 |
| 3644 | 560.871 |
| 3645 | 559.841 |
| 3646 | 558.841 |
| 3647 | 557.841 |
| 3648 | 556.841 |
| 3649 | 555.841 |
| 3650 | 554.841 |
| 3651 | 553.641 |
| 3652 | 574.441 |
| 3653 | 573.441 |
| 3654 | 572.441 |
| 3655 | 571.441 |
| 3656 | 570.441 |
| 3657 | 569.441 |
| 3658 | 568.441 |
| 3659 | 567.441 |
| 3660 | 566.441 |
| 3661 | 565.441 |
| 3662 | 564.441 |
| 3663 | 563.441 |
| 3664 | 562.396 |
| 3665 | 567.751 |
| 3666 | 566.751 |
| 3667 | 565.751 |
| 3668 | 564.751 |
| 3669 | 563.751 |
| 3670 | 562.751 |
| 3671 | 561.751 |
| 3672 | 560.751 |
| 3673 | 559.751 |
| 3674 | 558.751 |
| 3675 | 557.751 |
| 3676 | 556.751 |
| 3677 | 555.751 |
| 3678 | 554.751 |
| 3679 | 553.751 |
| 3680 | 552.751 |
| 3681 | 551.751 |
| 3682 | 550.751 |
| 3683 | 549.751 |
| 3684 | 548.751 |
| 3685 | 547.751 |
| 3686 | 546.751 |
| 3687 | 545.751 |
| 3688 | 544.751 |
| 3689 | 543.751 |
| 3690 | 542.751 |
| 3691 | 541.751 |
| 3692 | 540.751 |
| 3693 | 539.751 |
| 3694 | 538.751 |
| 3695 | 537.471 |
| 3696 | 566.191 |
| 3697 | 573.358 |
| 3698 | 572.324 |
| 3699 | 571.291 |
| 3700 | 570.291 |
| 3701 | 569.291 |
| 3702 | 568.291 |
| 3703 | 567.291 |
| 3704 | 566.291 |
| 3705 | 565.291 |
| 3706 | 564.291 |
| 3707 | 563.291 |
| 3708 | 562.291 |
| 3709 | 561.291 |
| 3710 | 560.291 |
| 3711 | 559.291 |
| 3712 | 558.291 |
| 3713 | 557.291 |
| 3714 | 555.911 |
| 3715 | 554.531 |
| 3716 | 613.151 |
| 3717 | 612.151 |
| 3718 | 611.151 |
| 3719 | 610.151 |
| 3720 | 609.151 |
| 3721 | 608.151 |
| 3722 | 607.151 |
| 3723 | 606.151 |
| 3724 | 605.151 |
| 3725 | 604.151 |
| 3726 | 603.151 |
| 3727 | 602.151 |
| 3728 | 601.151 |
| 3729 | 600.151 |
| 3730 | 599.151 |
| 3731 | 598.151 |
| 3732 | 597.143 |
| 3733 | 602.935 |
| 3734 | 601.927 |
| 3735 | 600.919 |
| 3736 | 599.911 |
| 3737 | 598.861 |
| 3738 | 597.811 |
| 3739 | 607.261 |
| 3740 | 606.261 |
| 3741 | 605.261 |
| 3742 | 604.261 |
| 3743 | 603.261 |
| 3744 | 602.261 |
| 3745 | 601.261 |
| 3746 | 600.261 |
| 3747 | 599.261 |
| 3748 | 598.261 |
| 3749 | 597.261 |
| 3750 | 596.261 |
| 3751 | 595.261 |
| 3752 | 594.261 |
| 3753 | 593.261 |
| 3754 | 592.261 |
| 3755 | 591.261 |
| 3756 | 590.261 |
| 3757 | 589.261 |
| 3758 | 588.261 |
| 3759 | 587.261 |
| 3760 | 586.261 |
| 3761 | 585.261 |
| 3762 | 584.261 |
| 3763 | 583.261 |
| 3764 | 582.261 |
| 3765 | 581.261 |
| 3766 | 580.261 |
| 3767 | 579.261 |
| 3768 | 578.261 |
| 3769 | 577.261 |
| 3770 | 576.228 |
| 3771 | 583.194 |
| 3772 | 582.161 |
| 3773 | 581.161 |
| 3774 | 580.161 |
| 3775 | 579.101 |
| 3776 | 585.841 |
| 3777 | 584.796 |
| 3778 | 596.751 |
| 3779 | 595.706 |
| 3780 | 594.661 |
| 3781 | 593.661 |
| 3782 | 592.661 |
| 3783 | 591.661 |
| 3784 | 590.661 |
| 3785 | 589.621 |
| 3786 | 594.581 |
| 3787 | 597.256 |
| 3788 | 596.256 |
| 3789 | 595.256 |
| 3790 | 594.256 |
| 3791 | 593.256 |
| 3792 | 592.256 |
| 3793 | 591.256 |
| 3794 | 590.256 |
| 3795 | 589.223 |
| 3796 | 596.389 |
| 3797 | 595.356 |
| 3798 | 594.356 |
| 3799 | 593.356 |
| 3800 | 592.356 |
| 3801 | 591.356 |
| 3802 | 598.296 |
| 3803 | 597.236 |
| 3804 | 602.216 |
| 3805 | 601.196 |
| 3806 | 600.176 |
| 3807 | 599.176 |
| 3808 | 598.176 |
| 3809 | 597.176 |
| 3810 | 596.176 |
| 3811 | 595.176 |
| 3812 | 594.176 |
| 3813 | 593.176 |
| 3814 | 592.176 |
| 3815 | 591.176 |
| 3816 | 590.176 |
| 3817 | 589.176 |
| 3818 | 588.176 |
| 3819 | 587.176 |
| 3820 | 586.176 |
| 3821 | 585.176 |
| 3822 | 584.176 |
| 3823 | 583.176 |
| 3824 | 582.176 |
| 3825 | 581.176 |
| 3826 | 580.176 |
| 3827 | 579.176 |
| 3828 | 578.176 |
| 3829 | 577.176 |
| 3830 | 576.176 |
| 3831 | 575.176 |
| 3832 | 574.176 |
| 3833 | 573.176 |
| 3834 | 572.176 |
| 3835 | 571.176 |
| 3836 | 570.164 |
| 3837 | 577.152 |
| 3838 | 576.14 |
| 3839 | 575.128 |
| 3840 | 574.116 |
| 3841 | 573.116 |
| 3842 | 572.116 |
| 3843 | 571.116 |
| 3844 | 570.116 |
| 3845 | 569.116 |
| 3846 | 568.116 |
| 3847 | 567.116 |
| 3848 | 566.116 |
| 3849 | 565.116 |
| 3850 | 564.116 |
| 3851 | 563.116 |
| 3852 | 562.116 |
| 3853 | 561.116 |
| 3854 | 560.116 |
| 3855 | 559.116 |
| 3856 | 558.116 |
| 3857 | 557.116 |
| 3858 | 556.116 |
| 3859 | 555.116 |
| 3860 | 554.116 |
| 3861 | 553.116 |
| 3862 | 552.116 |
| 3863 | 551.116 |
| 3864 | 550.071 |
| 3865 | 555.626 |
| 3866 | 554.626 |
| 3867 | 553.626 |
| 3868 | 552.564 |
| 3869 | 551.501 |
| 3870 | 566.939 |
| 3871 | 565.876 |
| 3872 | 564.876 |
| 3873 | 563.876 |
| 3874 | 562.876 |
| 3875 | 561.876 |
| 3876 | 560.876 |
| 3877 | 559.876 |
| 3878 | 558.876 |
| 3879 | 557.876 |
| 3880 | 556.876 |
| 3881 | 555.876 |
| 3882 | 554.876 |
| 3883 | 553.876 |
| 3884 | 552.876 |
| 3885 | 551.876 |
| 3886 | 550.876 |
| 3887 | 549.876 |
| 3888 | 548.876 |
| 3889 | 547.876 |
| 3890 | 546.876 |
| 3891 | 545.856 |
| 3892 | 552.836 |
| 3893 | 551.816 |
| 3894 | 550.796 |
| 3895 | 549.796 |
| 3896 | 548.796 |
| 3897 | 547.796 |
| 3898 | 546.796 |
| 3899 | 545.796 |
| 3900 | 544.796 |
| 3901 | 543.796 |
| 3902 | 542.796 |
| 3903 | 541.796 |
| 3904 | 545.186 |
| 3905 | 544.176 |
| 3906 | 543.166 |
| 3907 | 542.089 |
| 3908 | 555.513 |
| 3909 | 554.436 |
| 3910 | 553.436 |
| 3911 | 552.436 |
| 3912 | 551.436 |
| 3913 | 550.436 |
| 3914 | 549.436 |
| 3915 | 548.436 |
| 3916 | 547.436 |
| 3917 | 546.436 |
| 3918 | 545.436 |
| 3919 | 544.436 |
| 3920 | 543.436 |
| 3921 | 542.436 |
| 3922 | 541.436 |
| 3923 | 540.436 |
| 3924 | 539.436 |
| 3925 | 538.436 |
| 3926 | 537.436 |
| 3927 | 536.436 |
| 3928 | 535.436 |
| 3929 | 534.436 |
| 3930 | 533.436 |
| 3931 | 532.436 |
| 3932 | 531.436 |
| 3933 | 530.436 |
| 3934 | 529.436 |
| 3935 | 528.436 |
| 3936 | 527.436 |
| 3937 | 526.436 |
| 3938 | 525.436 |
| 3939 | 524.436 |
| 3940 | 523.436 |
| 3941 | 522.436 |
| 3942 | 521.436 |
| 3943 | 526.326 |
| 3944 | 525.316 |
| 3945 | 524.306 |
| 3946 | 523.296 |
| 3947 | 522.296 |
| 3948 | 521.296 |
| 3949 | 520.296 |
| 3950 | 519.296 |
| 3951 | 518.296 |
| 3952 | 517.296 |
| 3953 | 516.296 |
| 3954 | 518.681 |
| 3955 | 517.666 |
| 3956 | 516.666 |
| 3957 | 515.666 |
| 3958 | 514.666 |
| 3959 | 513.666 |
| 3960 | 512.446 |
| 3961 | 535.226 |
| 3962 | 534.226 |
| 3963 | 533.226 |
| 3964 | 532.226 |
| 3965 | 531.226 |
| 3966 | 530.226 |
| 3967 | 529.226 |
| 3968 | 528.226 |
| 3969 | 527.226 |
| 3970 | 526.226 |
| 3971 | 525.136 |
| 3972 | 524.046 |
| 3973 | 539.456 |
| 3974 | 538.456 |
| 3975 | 537.456 |
| 3976 | 536.456 |
| 3977 | 535.456 |
| 3978 | 534.456 |
| 3979 | 533.456 |
| 3980 | 532.456 |
| 3981 | 531.456 |
| 3982 | 530.456 |
| 3983 | 529.456 |
| 3984 | 528.456 |
| 3985 | 527.456 |
| 3986 | 526.456 |
| 3987 | 525.456 |
| 3988 | 524.456 |
| 3989 | 523.456 |
| 3990 | 522.456 |
| 3991 | 521.456 |
| 3992 | 520.456 |
| 3993 | 519.456 |
| 3994 | 518.456 |
| 3995 | 517.456 |
| 3996 | 516.456 |
| 3997 | 515.456 |
| 3998 | 514.456 |
| 3999 | 513.456 |
| 4000 | 512.456 |
| 4001 | 511.456 |
| 4002 | 510.456 |
| 4003 | 509.456 |
| 4004 | 508.456 |
| 4005 | 507.456 |
| 4006 | 506.456 |
| 4007 | 505.456 |
| 4008 | 504.399 |
| 4009 | 514.843 |
| 4010 | 513.786 |
| 4011 | 512.786 |
| 4012 | 511.786 |
| 4013 | 510.786 |
| 4014 | 509.786 |
| 4015 | 508.786 |
| 4016 | 507.786 |
| 4017 | 506.786 |
| 4018 | 505.786 |
| 4019 | 504.786 |
| 4020 | 503.786 |
| 4021 | 502.786 |
| 4022 | 501.786 |
| 4023 | 500.786 |
| 4024 | 499.786 |
| 4025 | 498.786 |
| 4026 | 497.786 |
| 4027 | 496.786 |
| 4028 | 495.786 |
| 4029 | 494.786 |
| 4030 | 493.786 |
| 4031 | 492.786 |
| 4032 | 491.786 |
| 4033 | 509.616 |
| 4034 | 508.446 |
| 4035 | 507.446 |
| 4036 | 506.446 |
| 4037 | 505.446 |
| 4038 | 504.446 |
| 4039 | 503.446 |
| 4040 | 502.446 |
| 4041 | 501.446 |
| 4042 | 500.446 |
| 4043 | 499.446 |
| 4044 | 498.446 |
| 4045 | 497.446 |
| 4046 | 496.446 |
| 4047 | 495.446 |
| 4048 | 494.446 |
| 4049 | 493.446 |
| 4050 | 492.446 |
| 4051 | 491.446 |
| 4052 | 490.446 |
| 4053 | 489.446 |
| 4054 | 488.446 |
| 4055 | 487.446 |
| 4056 | 486.446 |
| 4057 | 485.446 |
| 4058 | 484.446 |
| 4059 | 483.446 |
| 4060 | 482.446 |
| 4061 | 481.446 |
| 4062 | 480.446 |
| 4063 | 479.446 |
| 4064 | 478.446 |
| 4065 | 477.446 |
| 4066 | 476.446 |
| 4067 | 475.446 |
| 4068 | 474.446 |
| 4069 | 473.446 |
| 4070 | 472.446 |
| 4071 | 471.446 |
| 4072 | 470.446 |
| 4073 | 469.446 |
| 4074 | 468.446 |
| 4075 | 467.446 |
| 4076 | 466.446 |
| 4077 | 465.446 |
| 4078 | 464.446 |
| 4079 | 463.446 |
| 4080 | 462.446 |
| 4081 | 461.446 |
| 4082 | 460.306 |
| 4083 | 475.166 |
| 4084 | 480.326 |
| 4085 | 479.286 |
| 4086 | 478.286 |
| 4087 | 477.286 |
| 4088 | 476.286 |
| 4089 | 475.286 |
| 4090 | 479.579 |
| 4091 | 478.571 |
| 4092 | 477.564 |
| 4093 | 476.556 |
| 4094 | 475.526 |
| 4095 | 482.096 |
| 4096 | 481.066 |
| 4097 | 480.066 |
| 4098 | 479.066 |
| 4099 | 478.066 |
| 4100 | 477.066 |
| 4101 | 476.066 |
| 4102 | 480.449 |
| 4103 | 479.433 |
| 4104 | 478.416 |
| 4105 | 477.416 |
| 4106 | 476.416 |
| 4107 | 475.416 |
| 4108 | 474.416 |
| 4109 | 473.416 |
| 4110 | 472.416 |
| 4111 | 471.416 |
| 4112 | 470.416 |
| 4113 | 469.416 |
| 4114 | 468.416 |
| 4115 | 467.416 |
| 4116 | 466.416 |
| 4117 | 465.416 |
| 4118 | 464.416 |
| 4119 | 463.416 |
| 4120 | 462.416 |
| 4121 | 461.416 |
| 4122 | 460.416 |
| 4123 | 459.416 |
| 4124 | 458.416 |
| 4125 | 457.416 |
| 4126 | 456.416 |
| 4127 | 455.353 |
| 4128 | 466.789 |
| 4129 | 465.726 |
| 4130 | 464.726 |
| 4131 | 463.726 |
| 4132 | 462.726 |
| 4133 | 461.726 |
| 4134 | 460.726 |
| 4135 | 459.726 |
| 4136 | 458.726 |
| 4137 | 457.726 |
| 4138 | 456.726 |
| 4139 | 455.726 |
| 4140 | 454.726 |
| 4141 | 453.726 |
| 4142 | 452.726 |
| 4143 | 451.726 |
| 4144 | 450.726 |
| 4145 | 449.726 |
| 4146 | 448.726 |
| 4147 | 447.726 |
| 4148 | 446.726 |
| 4149 | 445.726 |
| 4150 | 444.726 |
| 4151 | 443.726 |
| 4152 | 442.726 |
| 4153 | 441.726 |
| 4154 | 440.726 |
| 4155 | 439.726 |
| 4156 | 438.726 |
| 4157 | 437.726 |
| 4158 | 436.726 |
| 4159 | 435.726 |
| 4160 | 434.726 |
| 4161 | 433.726 |
| 4162 | 432.726 |
| 4163 | 431.726 |
| 4164 | 430.726 |
| 4165 | 429.726 |
| 4166 | 428.726 |
| 4167 | 427.726 |
| 4168 | 426.726 |
| 4169 | 425.726 |
| 4170 | 424.726 |
| 4171 | 423.726 |
| 4172 | 422.726 |
| 4173 | 421.726 |
| 4174 | 420.726 |
| 4175 | 419.726 |
| 4176 | 418.726 |
| 4177 | 417.726 |
| 4178 | 416.726 |
| 4179 | 415.626 |
| 4180 | 414.526 |
| 4181 | 437.426 |
| 4182 | 436.326 |
| 4183 | 435.326 |
| 4184 | 434.326 |
| 4185 | 433.326 |
| 4186 | 432.326 |
| 4187 | 431.326 |
| 4188 | 430.326 |
| 4189 | 429.326 |
| 4190 | 428.326 |
| 4191 | 427.326 |
| 4192 | 426.326 |
| 4193 | 425.326 |
| 4194 | 424.326 |
| 4195 | 423.326 |
| 4196 | 422.326 |
| 4197 | 421.326 |
| 4198 | 420.326 |
| 4199 | 419.326 |
| 4200 | 418.326 |
| 4201 | 417.311 |
| 4202 | 423.096 |
| 4203 | 422.081 |
| 4204 | 421.066 |
| 4205 | 420.066 |
| 4206 | 419.066 |
| 4207 | 418.066 |
| 4208 | 417.066 |
| 4209 | 438.971 |
| 4210 | 437.876 |
| 4211 | 436.781 |
| 4212 | 435.686 |
| 4213 | 434.664 |
| 4214 | 442.041 |
| 4215 | 441.019 |
| 4216 | 439.996 |
| 4217 | 443.196 |
| 4218 | 442.196 |
| 4219 | 441.196 |
| 4220 | 440.196 |
| 4221 | 439.196 |
| 4222 | 438.196 |
| 4223 | 437.196 |
| 4224 | 436.196 |
| 4225 | 435.196 |
| 4226 | 434.196 |
| 4227 | 433.196 |
| 4228 | 432.196 |
| 4229 | 431.196 |
| 4230 | 430.196 |
| 4231 | 429.196 |
| 4232 | 428.196 |
| 4233 | 427.196 |
| 4234 | 426.196 |
| 4235 | 425.196 |
| 4236 | 424.146 |
| 4237 | 423.096 |
| 4238 | 422.046 |
| 4239 | 434.996 |
| 4240 | 440.384 |
| 4241 | 439.371 |
| 4242 | 438.359 |
| 4243 | 437.346 |
| 4244 | 436.346 |
| 4245 | 435.346 |
| 4246 | 434.346 |
| 4247 | 433.346 |
| 4248 | 432.346 |
| 4249 | 431.346 |
| 4250 | 430.346 |
| 4251 | 429.346 |
| 4252 | 428.346 |
| 4253 | 427.346 |
| 4254 | 426.346 |
| 4255 | 425.346 |
| 4256 | 424.346 |
| 4257 | 423.346 |
| 4258 | 422.346 |
| 4259 | 427.306 |
| 4260 | 426.266 |
| 4261 | 425.266 |
| 4262 | 424.266 |
| 4263 | 427.459 |
| 4264 | 426.453 |
| 4265 | 425.446 |
| 4266 | 424.446 |
| 4267 | 423.446 |
| 4268 | 422.446 |
| 4269 | 421.446 |
| 4270 | 420.446 |
| 4271 | 419.389 |
| 4272 | 429.833 |
| 4273 | 428.776 |
| 4274 | 427.776 |
| 4275 | 426.776 |
| 4276 | 425.776 |
| 4277 | 424.776 |
| 4278 | 423.776 |
| 4279 | 422.776 |
| 4280 | 421.776 |
| 4281 | 420.776 |
| 4282 | 419.776 |
| 4283 | 418.776 |
| 4284 | 417.776 |
| 4285 | 416.776 |
| 4286 | 415.776 |
| 4287 | 414.776 |
| 4288 | 413.776 |
| 4289 | 412.776 |
| 4290 | 411.776 |
| 4291 | 410.776 |
| 4292 | 409.776 |
| 4293 | 408.776 |
| 4294 | 407.681 |
| 4295 | 418.086 |
| 4296 | 417.019 |
| 4297 | 415.953 |
| 4298 | 426.881 |
| 4299 | 425.881 |
| 4300 | 424.881 |
| 4301 | 423.881 |
| 4302 | 422.881 |
| 4303 | 421.881 |
| 4304 | 420.881 |
| 4305 | 419.881 |
| 4306 | 418.881 |
| 4307 | 417.881 |
| 4308 | 423.654 |
| 4309 | 422.628 |
| 4310 | 421.601 |
| 4311 | 420.521 |
| 4312 | 419.441 |
| 4313 | 433.361 |
| 4314 | 432.361 |
| 4315 | 431.361 |
| 4316 | 430.361 |
| 4317 | 429.361 |
| 4318 | 428.361 |
| 4319 | 427.361 |
| 4320 | 431.954 |
| 4321 | 430.946 |
| 4322 | 429.939 |
| 4323 | 428.931 |
| 4324 | 427.931 |
| 4325 | 426.931 |
| 4326 | 425.931 |
| 4327 | 424.931 |
| 4328 | 423.931 |
| 4329 | 422.931 |
| 4330 | 421.931 |
| 4331 | 420.874 |
| 4332 | 419.816 |
| 4333 | 434.259 |
| 4334 | 433.201 |
| 4335 | 432.171 |
| 4336 | 441.141 |
| 4337 | 440.111 |
| 4338 | 439.081 |
| 4339 | 438.039 |
| 4340 | 436.996 |
| 4341 | 448.454 |
| 4342 | 447.411 |
| 4343 | 446.411 |
| 4344 | 445.411 |
| 4345 | 444.411 |
| 4346 | 443.411 |
| 4347 | 442.359 |
| 4348 | 455.806 |
| 4349 | 454.754 |
| 4350 | 453.701 |
| 4351 | 466.651 |
| 4352 | 465.601 |
| 4353 | 464.551 |
| 4354 | 463.501 |
| 4355 | 462.501 |
| 4356 | 461.501 |
| 4357 | 460.501 |
| 4358 | 459.501 |
| 4359 | 458.501 |
| 4360 | 457.501 |
| 4361 | 456.501 |
| 4362 | 455.501 |
| 4363 | 454.501 |
| 4364 | 453.501 |
| 4365 | 452.501 |
| 4366 | 451.501 |
| 4367 | 450.501 |
| 4368 | 453.891 |
| 4369 | 452.881 |
| 4370 | 451.871 |
| 4371 | 456.264 |
| 4372 | 455.256 |
| 4373 | 454.249 |
| 4374 | 453.241 |
| 4375 | 452.241 |
| 4376 | 451.241 |
| 4377 | 450.241 |
| 4378 | 449.241 |
| 4379 | 448.241 |
| 4380 | 447.241 |
| 4381 | 460.689 |
| 4382 | 459.636 |
| 4383 | 458.584 |
| 4384 | 457.531 |
| 4385 | 456.531 |
| 4386 | 455.531 |
| 4387 | 454.531 |
| 4388 | 453.531 |
| 4389 | 452.531 |
| 4390 | 451.531 |
| 4391 | 450.531 |
| 4392 | 449.531 |
| 4393 | 448.531 |
| 4394 | 452.896 |
| 4395 | 451.861 |
| 4396 | 450.751 |
| 4397 | 449.641 |
| 4398 | 468.031 |
| 4399 | 467.031 |
| 4400 | 466.031 |
| 4401 | 469.729 |
| 4402 | 468.726 |
| 4403 | 467.724 |
| 4404 | 466.721 |
| 4405 | 465.721 |
| 4406 | 464.721 |
| 4407 | 463.721 |
| 4408 | 462.721 |
| 4409 | 461.721 |
| 4410 | 460.721 |
| 4411 | 459.721 |
| 4412 | 458.721 |
| 4413 | 457.721 |
| 4414 | 456.721 |
| 4415 | 455.721 |
| 4416 | 454.721 |
| 4417 | 453.721 |
| 4418 | 452.721 |
| 4419 | 451.721 |
| 4420 | 450.721 |
| 4421 | 449.721 |
| 4422 | 448.721 |
| 4423 | 447.721 |
| 4424 | 446.721 |
| 4425 | 445.721 |
| 4426 | 444.721 |
| 4427 | 443.721 |
| 4428 | 442.721 |
| 4429 | 441.721 |
| 4430 | 440.721 |
| 4431 | 439.676 |
| 4432 | 438.631 |
| 4433 | 437.586 |
| 4434 | 449.541 |
| 4435 | 456.308 |
| 4436 | 455.274 |
| 4437 | 454.241 |
| 4438 | 453.241 |
| 4439 | 452.241 |
| 4440 | 451.178 |
| 4441 | 462.614 |
| 4442 | 461.551 |
| 4443 | 460.551 |
| 4444 | 459.551 |
| 4445 | 465.301 |
| 4446 | 464.251 |
| 4447 | 471.031 |
| 4448 | 470.011 |
| 4449 | 468.991 |
| 4450 | 467.971 |
| 4451 | 466.971 |
| 4452 | 465.971 |
| 4453 | 464.971 |
| 4454 | 463.971 |
| 4455 | 462.971 |
| 4456 | 461.971 |
| 4457 | 460.971 |
| 4458 | 459.971 |
| 4459 | 458.971 |
| 4460 | 457.971 |
| 4461 | 456.971 |
| 4462 | 455.971 |
| 4463 | 454.971 |
| 4464 | 453.971 |
| 4465 | 452.971 |
| 4466 | 451.971 |
| 4467 | 450.971 |
| 4468 | 449.971 |
| 4469 | 448.971 |
| 4470 | 447.971 |
| 4471 | 446.971 |
| 4472 | 445.971 |
| 4473 | 444.971 |
| 4474 | 443.971 |
| 4475 | 442.971 |
| 4476 | 441.971 |
| 4477 | 440.971 |
| 4478 | 439.971 |
| 4479 | 438.971 |
| 4480 | 437.971 |
| 4481 | 436.971 |
| 4482 | 435.971 |
| 4483 | 442.144 |
| 4484 | 441.118 |
| 4485 | 440.091 |
| 4486 | 442.526 |
| 4487 | 441.511 |
| 4488 | 440.511 |
| 4489 | 439.511 |
| 4490 | 438.511 |
| 4491 | 437.511 |
| 4492 | 436.489 |
| 4493 | 444.066 |
| 4494 | 443.044 |
| 4495 | 442.021 |
| 4496 | 441.021 |
| 4497 | 440.021 |
| 4498 | 439.021 |
| 4499 | 438.021 |
| 4500 | 437.021 |
| 4501 | 436.021 |
| 4502 | 435.021 |
| 4503 | 433.941 |
| 4504 | 432.861 |
| 4505 | 431.781 |
| 4506 | 450.701 |
| 4507 | 449.701 |
| 4508 | 448.701 |
| 4509 | 447.701 |
| 4510 | 446.701 |
| 4511 | 445.701 |
| 4512 | 444.701 |
| 4513 | 443.701 |
| 4514 | 442.701 |
| 4515 | 441.701 |
| 4516 | 440.701 |
| 4517 | 439.701 |
| 4518 | 438.701 |
| 4519 | 437.701 |
| 4520 | 436.701 |
| 4521 | 435.701 |
| 4522 | 434.701 |
| 4523 | 433.701 |
| 4524 | 432.701 |
| 4525 | 431.701 |
| 4526 | 434.894 |
| 4527 | 433.888 |
| 4528 | 432.881 |
| 4529 | 431.741 |
| 4530 | 430.601 |
| 4531 | 453.461 |
| 4532 | 452.461 |
| 4533 | 451.461 |
| 4534 | 450.461 |
| 4535 | 449.461 |
| 4536 | 448.461 |
| 4537 | 447.461 |
| 4538 | 446.461 |
| 4539 | 445.461 |
| 4540 | 444.461 |
| 4541 | 443.461 |
| 4542 | 442.461 |
| 4543 | 441.461 |
| 4544 | 440.461 |
| 4545 | 439.461 |
| 4546 | 438.461 |
| 4547 | 437.461 |
| 4548 | 436.461 |
| 4549 | 435.461 |
| 4550 | 434.461 |
| 4551 | 433.461 |
| 4552 | 432.436 |
| 4553 | 440.211 |
| 4554 | 439.186 |
| 4555 | 438.161 |
| 4556 | 441.451 |
| 4557 | 440.441 |
| 4558 | 439.431 |
| 4559 | 446.598 |
| 4560 | 445.564 |
| 4561 | 444.531 |
| 4562 | 443.531 |
| 4563 | 442.531 |
| 4564 | 441.531 |
| 4565 | 440.531 |
| 4566 | 439.531 |
| 4567 | 438.531 |
| 4568 | 437.531 |
| 4569 | 443.119 |
| 4570 | 442.106 |
| 4571 | 441.094 |
| 4572 | 440.081 |
| 4573 | 439.081 |
| 4574 | 438.081 |
| 4575 | 437.081 |
| 4576 | 436.081 |
| 4577 | 435.081 |
| 4578 | 434.081 |
| 4579 | 433.081 |
| 4580 | 432.081 |
| 4581 | 431.081 |
| 4582 | 430.056 |
| 4583 | 437.831 |
| 4584 | 436.806 |
| 4585 | 435.781 |
| 4586 | 434.781 |
| 4587 | 433.781 |
| 4588 | 432.781 |
| 4589 | 431.781 |
| 4590 | 430.781 |
| 4591 | 429.781 |
| 4592 | 428.781 |
| 4593 | 427.781 |
| 4594 | 426.781 |
| 4595 | 425.781 |
| 4596 | 424.781 |
| 4597 | 423.781 |
| 4598 | 422.781 |
| 4599 | 421.781 |
| 4600 | 420.781 |
| 4601 | 419.781 |
| 4602 | 418.781 |
| 4603 | 424.566 |
| 4604 | 423.551 |
| 4605 | 422.536 |
| 4606 | 421.521 |
| 4607 | 429.084 |
| 4608 | 428.048 |
| 4609 | 427.011 |
| 4610 | 426.011 |
| 4611 | 425.011 |
| 4612 | 424.011 |
| 4613 | 423.011 |
| 4614 | 422.011 |
| 4615 | 421.011 |
| 4616 | 420.011 |
| 4617 | 419.011 |
| 4618 | 418.011 |
| 4619 | 417.011 |
| 4620 | 416.011 |
| 4621 | 415.011 |
| 4622 | 414.011 |
| 4623 | 413.011 |
| 4624 | 412.011 |
| 4625 | 411.011 |
| 4626 | 414.091 |
| 4627 | 413.071 |
| 4628 | 412.071 |
| 4629 | 411.071 |
| 4630 | 414.501 |
| 4631 | 413.501 |
| 4632 | 412.501 |
| 4633 | 411.501 |
| 4634 | 410.501 |
| 4635 | 414.321 |
| 4636 | 413.321 |
| 4637 | 412.321 |
| 4638 | 411.321 |
| 4639 | 410.321 |
| 4640 | 413.851 |
| 4641 | 412.851 |
| 4642 | 415.351 |
| 4643 | 414.351 |
| 4644 | 417.091 |
| 4645 | 419.871 |
| 4646 | 418.851 |
| 4647 | 417.851 |
| 4648 | 420.791 |
| 4649 | 423.581 |
| 4650 | 426.181 |
| 4651 | 429.161 |
| 4652 | 428.141 |
| 4653 | 427.141 |
| 4654 | 426.141 |
| 4655 | 425.141 |
| 4656 | 424.141 |
| 4657 | 423.141 |
| 4658 | 422.141 |
| 4659 | 421.141 |
| 4660 | 420.141 |
| 4661 | 419.141 |
| 4662 | 418.141 |
| 4663 | 417.141 |
| 4664 | 420.516 |
| 4665 | 419.491 |
| 4666 | 418.491 |
| 4667 | 417.491 |
| 4668 | 416.491 |
| 4669 | 415.491 |
| 4670 | 414.491 |
| 4671 | 413.491 |
| 4672 | 417.121 |
| 4673 | 416.121 |
| 4674 | 415.121 |
| 4675 | 414.121 |
| 4676 | 413.121 |
| 4677 | 412.121 |
| 4678 | 411.121 |
| 4679 | 410.121 |
| 4680 | 409.121 |
| 4681 | 408.121 |
| 4682 | 407.121 |
| 4683 | 406.121 |
| 4684 | 409.261 |
| 4685 | 408.241 |
| 4686 | 411.221 |
| 4687 | 410.221 |
| 4688 | 409.221 |
| 4689 | 413.041 |
| 4690 | 412.041 |
| 4691 | 411.041 |
| 4692 | 410.041 |
| 4693 | 409.041 |
| 4694 | 408.041 |
| 4695 | 407.041 |
| 4696 | 406.041 |
| 4697 | 405.041 |
| 4698 | 404.041 |
| 4699 | 403.041 |
| 4700 | 402.041 |
| 4701 | 401.041 |
| 4702 | 400.041 |
| 4703 | 399.041 |
| 4704 | 398.041 |
| 4705 | 400.626 |
| 4706 | 399.611 |
| 4707 | 398.611 |
| 4708 | 402.631 |
| 4709 | 406.451 |
| 4710 | 405.451 |
| 4711 | 408.136 |
| 4712 | 407.121 |
| 4713 | 406.096 |
| 4714 | 409.371 |
| 4715 | 408.371 |
| 4716 | 410.856 |
| 4717 | 409.841 |
| 4718 | 408.841 |
| 4719 | 407.816 |
| 4720 | 411.091 |
| 4721 | 410.091 |
| 4722 | 409.091 |
| 4723 | 408.091 |
| 4724 | 407.091 |
| 4725 | 406.091 |
| 4726 | 405.091 |
| 4727 | 404.091 |
| 4728 | 403.091 |
| 4729 | 406.421 |
| 4730 | 405.421 |
| 4731 | 404.421 |
| 4732 | 403.421 |
| 4733 | 402.421 |
| 4734 | 401.421 |
| 4735 | 400.421 |
| 4736 | 399.421 |
| 4737 | 398.421 |
| 4738 | 397.421 |
| 4739 | 396.421 |
| 4740 | 402.101 |
| 4741 | 401.101 |
| 4742 | 400.101 |
| 4743 | 399.101 |
| 4744 | 402.631 |
| 4745 | 401.631 |
| 4746 | 400.631 |
| 4747 | 403.321 |
| 4748 | 402.321 |
| 4749 | 404.821 |
| 4750 | 403.821 |
| 4751 | 408.431 |
| 4752 | 407.431 |
| 4753 | 406.431 |
| 4754 | 405.431 |
| 4755 | 408.471 |
| 4756 | 407.471 |
| 4757 | 406.471 |
| 4758 | 405.471 |
| 4759 | 404.471 |
| 4760 | 403.471 |
| 4761 | 402.471 |
| 4762 | 401.471 |
| 4763 | 404.106 |
| 4764 | 403.091 |
| 4765 | 402.091 |
| 4766 | 401.091 |
| 4767 | 400.091 |
| 4768 | 399.091 |
| 4769 | 398.091 |
| 4770 | 397.091 |
| 4771 | 396.091 |
| 4772 | 395.091 |
| 4773 | 394.071 |
| 4774 | 396.901 |
| 4775 | 395.901 |
| 4776 | 394.901 |
| 4777 | 393.901 |
| 4778 | 392.901 |
| 4779 | 391.901 |
| 4780 | 390.901 |
| 4781 | 389.901 |
| 4782 | 388.901 |
| 4783 | 387.901 |
| 4784 | 386.901 |
| 4785 | 385.901 |
| 4786 | 384.901 |
| 4787 | 383.901 |
| 4788 | 382.901 |
| 4789 | 381.901 |
| 4790 | 384.981 |
| 4791 | 383.961 |
| 4792 | 382.946 |
| 4793 | 385.631 |
| 4794 | 389.551 |
| 4795 | 388.551 |
| 4796 | 391.441 |
| 4797 | 390.441 |
| 4798 | 389.441 |
| 4799 | 388.441 |
| 4800 | 387.441 |
| 4801 | 386.441 |
| 4802 | 389.771 |
| 4803 | 388.771 |
| 4804 | 387.771 |
| 4805 | 390.256 |
| 4806 | 389.241 |
| 4807 | 388.241 |
| 4808 | 387.241 |
| 4809 | 386.241 |
| 4810 | 385.241 |
| 4811 | 384.241 |
| 4812 | 383.241 |
| 4813 | 388.731 |
| 4814 | 387.731 |
| 4815 | 386.731 |
| 4816 | 385.731 |
| 4817 | 384.731 |
| 4818 | 387.331 |
| 4819 | 386.331 |
| 4820 | 385.331 |
| 4821 | 388.111 |
| 4822 | 387.091 |
| 4823 | 390.421 |
| 4824 | 389.421 |
| 4825 | 392.311 |
| 4826 | 391.311 |
| 4827 | 390.311 |
| 4828 | 389.311 |
| 4829 | 388.311 |
| 4830 | 387.311 |
| 4831 | 391.131 |
| 4832 | 390.131 |
| 4833 | 394.301 |
| 4834 | 393.271 |
| 4835 | 396.901 |
| 4836 | 401.411 |
| 4837 | 400.411 |
| 4838 | 399.411 |
| 4839 | 403.821 |
| 4840 | 406.761 |
| 4841 | 405.761 |
| 4842 | 408.261 |
| 4843 | 407.261 |
| 4844 | 406.261 |
| 4845 | 405.261 |
| 4846 | 404.261 |
| 4847 | 407.936 |
| 4848 | 406.911 |
| 4849 | 409.651 |
| 4850 | 408.651 |
| 4851 | 407.631 |
| 4852 | 410.461 |
| 4853 | 413.736 |
| 4854 | 412.711 |
| 4855 | 411.711 |
| 4856 | 410.711 |
| 4857 | 413.591 |
| 4858 | 412.571 |
| 4859 | 411.571 |
| 4860 | 410.571 |
| 4861 | 409.571 |
| 4862 | 408.571 |
| 4863 | 407.571 |
| 4864 | 406.571 |
| 4865 | 405.571 |
| 4866 | 404.571 |
| 4867 | 403.571 |
| 4868 | 402.571 |
| 4869 | 401.571 |
| 4870 | 400.571 |
| 4871 | 399.571 |
| 4872 | 398.571 |
| 4873 | 397.571 |
| 4874 | 396.571 |
| 4875 | 395.571 |
| 4876 | 394.571 |
| 4877 | 393.571 |
| 4878 | 392.571 |
| 4879 | 391.571 |
| 4880 | 390.571 |
| 4881 | 393.711 |
| 4882 | 392.711 |
| 4883 | 391.711 |
| 4884 | 390.711 |
| 4885 | 389.711 |
| 4886 | 388.681 |
| 4887 | 392.451 |
| 4888 | 395.491 |
| 4889 | 394.491 |
| 4890 | 393.491 |
| 4891 | 392.491 |
| 4892 | 391.491 |
| 4893 | 390.491 |
| 4894 | 389.491 |
| 4895 | 388.491 |
| 4896 | 387.491 |
| 4897 | 386.466 |
| 4898 | 390.041 |
| 4899 | 389.041 |
| 4900 | 388.041 |
| 4901 | 387.041 |
| 4902 | 386.041 |
| 4903 | 385.041 |
| 4904 | 384.021 |
| 4905 | 386.851 |
| 4906 | 385.851 |
| 4907 | 384.831 |
| 4908 | 387.711 |
| 4909 | 386.691 |
| 4910 | 389.871 |
| 4911 | 388.871 |
| 4912 | 392.501 |
| 4913 | 391.501 |
| 4914 | 390.501 |
| 4915 | 393.051 |
| 4916 | 392.051 |
| 4917 | 391.051 |
| 4918 | 390.051 |
| 4919 | 389.051 |
| 4920 | 388.051 |
| 4921 | 387.051 |
| 4922 | 386.051 |
| 4923 | 385.051 |
| 4924 | 384.051 |
| 4925 | 387.281 |
| 4926 | 386.281 |
| 4927 | 385.281 |
| 4928 | 384.256 |
| 4929 | 387.731 |
| 4930 | 386.731 |
| 4931 | 385.731 |
| 4932 | 384.731 |
| 4933 | 383.731 |
| 4934 | 382.731 |
| 4935 | 381.731 |
| 4936 | 380.731 |
| 4937 | 379.731 |
| 4938 | 378.731 |
| 4939 | 377.731 |
| 4940 | 376.731 |
| 4941 | 380.651 |
| 4942 | 379.651 |
| 4943 | 378.651 |
| 4944 | 381.151 |
| 4945 | 380.151 |
| 4946 | 379.151 |
| 4947 | 378.151 |
| 4948 | 380.736 |
| 4949 | 379.721 |
| 4950 | 378.721 |
| 4951 | 377.721 |
| 4952 | 380.411 |
| 4953 | 379.411 |
| 4954 | 378.411 |
| 4955 | 377.411 |
| 4956 | 380.641 |
| 4957 | 379.641 |
| 4958 | 378.606 |
| 4959 | 383.271 |
| 4960 | 385.921 |
| 4961 | 388.701 |
| 4962 | 387.681 |
| 4963 | 390.911 |
| 4964 | 389.911 |
| 4965 | 388.911 |
| 4966 | 387.911 |
| 4967 | 386.911 |
| 4968 | 385.911 |
| 4969 | 384.911 |
| 4970 | 383.911 |
| 4971 | 382.911 |
| 4972 | 381.911 |
| 4973 | 380.911 |
| 4974 | 379.911 |
| 4975 | 378.911 |
| 4976 | 377.911 |
| 4977 | 381.441 |
| 4978 | 384.131 |
| 4979 | 383.131 |
| 4980 | 382.131 |
| 4981 | 381.106 |
| 4982 | 384.581 |
| 4983 | 383.561 |
| 4984 | 386.291 |
| 4985 | 385.291 |
| 4986 | 384.291 |
| 4987 | 383.291 |
| 4988 | 382.291 |
| 4989 | 381.291 |
| 4990 | 380.291 |
| 4991 | 379.291 |
| 4992 | 378.291 |
| 4993 | 377.291 |
| 4994 | 376.291 |
| 4995 | 375.291 |
| 4996 | 374.291 |
| 4997 | 373.291 |
| 4998 | 372.291 |
| 4999 | 371.291 |
| 5000 | 370.291 |
| 5001 | 369.291 |
| 5002 | 368.291 |
| 5003 | 367.291 |
| 5004 | 366.291 |
| 5005 | 365.291 |
| 5006 | 368.031 |
| 5007 | 367.031 |
| 5008 | 366.031 |
| 5009 | 365.031 |
| 5010 | 364.031 |
| 5011 | 367.461 |
| 5012 | 366.461 |
| 5013 | 365.461 |
| 5014 | 364.461 |
| 5015 | 363.461 |
| 5016 | 362.461 |
| 5017 | 361.461 |
| 5018 | 360.461 |
| 5019 | 359.461 |
| 5020 | 358.461 |
| 5021 | 361.601 |
| 5022 | 365.321 |
| 5023 | 364.321 |
| 5024 | 363.321 |
| 5025 | 366.651 |
| 5026 | 369.791 |
| 5027 | 368.791 |
| 5028 | 367.791 |
| 5029 | 366.791 |
| 5030 | 365.791 |
| 5031 | 364.791 |
| 5032 | 363.791 |
| 5033 | 367.611 |
| 5034 | 366.611 |
| 5035 | 365.611 |
| 5036 | 368.551 |
| 5037 | 367.551 |
| 5038 | 366.551 |
| 5039 | 365.551 |
| 5040 | 364.551 |
| 5041 | 363.551 |
| 5042 | 362.551 |
| 5043 | 361.551 |
| 5044 | 360.551 |
| 5045 | 359.551 |
| 5046 | 362.341 |
| 5047 | 361.341 |
| 5048 | 365.361 |
| 5049 | 368.151 |
| 5050 | 367.151 |
| 5051 | 370.381 |
| 5052 | 369.381 |
| 5053 | 368.381 |
| 5054 | 367.381 |
| 5055 | 371.011 |
| 5056 | 370.011 |
| 5057 | 369.011 |
| 5058 | 371.801 |
| 5059 | 370.801 |
| 5060 | 369.801 |
| 5061 | 374.501 |
| 5062 | 373.501 |
| 5063 | 372.501 |
| 5064 | 371.501 |
| 5065 | 370.501 |
| 5066 | 369.501 |
| 5067 | 374.401 |
| 5068 | 373.401 |
| 5069 | 372.401 |
| 5070 | 371.401 |
| 5071 | 374.731 |
| 5072 | 373.731 |
| 5073 | 372.731 |
| 5074 | 375.771 |
| 5075 | 374.771 |
| 5076 | 378.301 |
| 5077 | 377.301 |
| 5078 | 376.301 |
| 5079 | 375.301 |
| 5080 | 379.121 |
| 5081 | 378.121 |
| 5082 | 377.121 |
| 5083 | 381.431 |
| 5084 | 380.431 |
| 5085 | 383.271 |
| 5086 | 382.271 |
| 5087 | 381.271 |
| 5088 | 380.271 |
| 5089 | 379.271 |
| 5090 | 382.211 |
| 5091 | 381.211 |
| 5092 | 380.211 |
| 5093 | 379.211 |
| 5094 | 378.211 |
| 5095 | 377.211 |
| 5096 | 376.211 |
| 5097 | 375.211 |
| 5098 | 374.211 |
| 5099 | 373.211 |
| 5100 | 372.211 |
| 5101 | 371.211 |
| 5102 | 370.211 |
| 5103 | 373.151 |
| 5104 | 372.151 |
| 5105 | 371.151 |
| 5106 | 370.151 |
| 5107 | 373.781 |
| 5108 | 372.781 |
| 5109 | 371.781 |
| 5110 | 370.781 |
| 5111 | 369.781 |
| 5112 | 368.781 |
| 5113 | 367.781 |
| 5114 | 366.781 |
| 5115 | 365.781 |
| 5116 | 364.781 |
| 5117 | 363.781 |
| 5118 | 362.781 |
| 5119 | 361.781 |
| 5120 | 360.781 |
| 5121 | 359.781 |
| 5122 | 358.781 |
| 5123 | 357.781 |
| 5124 | 361.011 |
| 5125 | 360.011 |
| 5126 | 359.011 |
| 5127 | 358.011 |
| 5128 | 357.011 |
| 5129 | 360.441 |
| 5130 | 363.971 |
| 5131 | 362.971 |
| 5132 | 361.971 |
| 5133 | 360.971 |
| 5134 | 359.971 |
| 5135 | 358.971 |
| 5136 | 362.011 |
| 5137 | 361.011 |
| 5138 | 360.011 |
| 5139 | 359.011 |
| 5140 | 358.011 |
| 5141 | 361.831 |
| 5142 | 360.831 |
| 5143 | 359.831 |
| 5144 | 358.831 |
| 5145 | 361.521 |
| 5146 | 360.521 |
| 5147 | 359.521 |
| 5148 | 358.521 |
| 5149 | 363.421 |
| 5150 | 362.421 |
| 5151 | 361.421 |
| 5152 | 360.421 |
| 5153 | 359.421 |
| 5154 | 358.421 |
| 5155 | 362.631 |
| 5156 | 361.631 |
| 5157 | 364.671 |
| 5158 | 363.671 |
| 5159 | 362.671 |
| 5160 | 361.671 |
| 5161 | 360.671 |
| 5162 | 359.671 |
| 5163 | 358.671 |
| 5164 | 357.671 |
| 5165 | 356.671 |
| 5166 | 359.901 |
| 5167 | 358.901 |
| 5168 | 361.741 |
| 5169 | 360.741 |
| 5170 | 359.741 |
| 5171 | 362.431 |
| 5172 | 361.431 |
| 5173 | 364.221 |
| 5174 | 363.221 |
| 5175 | 362.221 |
| 5176 | 361.221 |
| 5177 | 360.221 |
| 5178 | 359.221 |
| 5179 | 358.221 |
| 5180 | 357.221 |
| 5181 | 356.221 |
| 5182 | 355.221 |
| 5183 | 354.221 |
| 5184 | 357.161 |
| 5185 | 356.161 |
| 5186 | 360.181 |
| 5187 | 359.181 |
| 5188 | 358.181 |
| 5189 | 357.181 |
| 5190 | 356.181 |
| 5191 | 355.181 |
| 5192 | 354.181 |
| 5193 | 353.181 |
| 5194 | 352.181 |
| 5195 | 355.711 |
| 5196 | 354.711 |
| 5197 | 353.711 |
| 5198 | 357.831 |
| 5199 | 360.521 |
| 5200 | 359.521 |
| 5201 | 358.521 |
| 5202 | 357.521 |
| 5203 | 356.521 |
| 5204 | 359.411 |
| 5205 | 358.411 |
| 5206 | 357.411 |
| 5207 | 356.411 |
| 5208 | 355.411 |
| 5209 | 354.411 |
| 5210 | 357.551 |
| 5211 | 360.781 |
| 5212 | 359.781 |
| 5213 | 358.781 |
| 5214 | 357.781 |
| 5215 | 356.781 |
| 5216 | 355.781 |
| 5217 | 354.781 |
| 5218 | 353.781 |
| 5219 | 352.781 |
| 5220 | 351.781 |
| 5221 | 350.781 |
| 5222 | 349.781 |
| 5223 | 352.721 |
| 5224 | 351.721 |
| 5225 | 350.721 |
| 5226 | 349.721 |
| 5227 | 348.721 |
| 5228 | 347.721 |
| 5229 | 346.721 |
| 5230 | 345.721 |
| 5231 | 344.721 |
| 5232 | 343.721 |
| 5233 | 346.511 |
| 5234 | 345.511 |
| 5235 | 344.511 |
| 5236 | 343.511 |
| 5237 | 346.201 |
| 5238 | 345.201 |
| 5239 | 344.201 |
| 5240 | 343.201 |
| 5241 | 342.201 |
| 5242 | 341.201 |
| 5243 | 340.201 |
| 5244 | 339.201 |
| 5245 | 338.201 |
| 5246 | 337.201 |
| 5247 | 336.201 |
| 5248 | 335.201 |
| 5249 | 334.201 |
| 5250 | 339.881 |
| 5251 | 338.881 |
| 5252 | 337.881 |
| 5253 | 336.881 |
| 5254 | 335.881 |
| 5255 | 334.881 |
| 5256 | 339.001 |
| 5257 | 338.001 |
| 5258 | 337.001 |
| 5259 | 336.001 |
| 5260 | 339.431 |
| 5261 | 338.431 |
| 5262 | 337.431 |
| 5263 | 336.431 |
| 5264 | 335.431 |
| 5265 | 334.431 |
| 5266 | 333.431 |
| 5267 | 332.431 |
| 5268 | 331.431 |
| 5269 | 330.431 |
| 5270 | 329.431 |
| 5271 | 328.431 |
| 5272 | 331.661 |
| 5273 | 330.661 |
| 5274 | 329.661 |
| 5275 | 328.661 |
| 5276 | 327.661 |
| 5277 | 326.661 |
| 5278 | 325.661 |
| 5279 | 324.661 |
| 5280 | 323.661 |
| 5281 | 322.661 |
| 5282 | 321.661 |
| 5283 | 320.661 |
| 5284 | 325.071 |
| 5285 | 324.071 |
| 5286 | 323.071 |
| 5287 | 322.071 |
| 5288 | 321.071 |
| 5289 | 324.011 |
| 5290 | 327.731 |
| 5291 | 326.731 |
| 5292 | 325.731 |
| 5293 | 324.731 |
| 5294 | 328.261 |
| 5295 | 327.261 |
| 5296 | 326.261 |
| 5297 | 325.261 |
| 5298 | 324.261 |
| 5299 | 323.261 |
| 5300 | 322.261 |
| 5301 | 321.261 |
| 5302 | 324.591 |
| 5303 | 328.121 |
| 5304 | 327.121 |
| 5305 | 326.121 |
| 5306 | 329.841 |
| 5307 | 328.841 |
| 5308 | 327.841 |
| 5309 | 326.841 |
| 5310 | 325.841 |
| 5311 | 329.071 |
| 5312 | 331.861 |
| 5313 | 330.861 |
| 5314 | 329.861 |
| 5315 | 328.861 |
| 5316 | 327.861 |
| 5317 | 326.861 |
| 5318 | 325.861 |
| 5319 | 324.861 |
| 5320 | 323.861 |
| 5321 | 322.861 |
| 5322 | 325.751 |
| 5323 | 324.751 |
| 5324 | 323.751 |
| 5325 | 326.791 |
| 5326 | 325.791 |
| 5327 | 324.791 |
| 5328 | 323.791 |
| 5329 | 322.791 |
| 5330 | 321.791 |
| 5331 | 320.791 |
| 5332 | 319.791 |
| 5333 | 323.321 |
| 5334 | 326.211 |
| 5335 | 325.211 |
| 5336 | 324.211 |
| 5337 | 323.211 |
| 5338 | 322.211 |
| 5339 | 321.211 |
| 5340 | 324.351 |
| 5341 | 323.351 |
| 5342 | 322.351 |
| 5343 | 321.351 |
| 5344 | 320.351 |
| 5345 | 319.351 |
| 5346 | 318.351 |
| 5347 | 322.761 |
| 5348 | 321.761 |
| 5349 | 320.761 |
| 5350 | 323.651 |
| 5351 | 327.771 |
| 5352 | 330.511 |
| 5353 | 329.511 |
| 5354 | 328.511 |
| 5355 | 327.511 |
| 5356 | 326.511 |
| 5357 | 325.511 |
| 5358 | 324.511 |
| 5359 | 323.511 |
| 5360 | 322.511 |
| 5361 | 321.511 |
| 5362 | 320.511 |
| 5363 | 319.511 |
| 5364 | 318.511 |
| 5365 | 321.451 |
| 5366 | 320.451 |
| 5367 | 319.451 |
| 5368 | 318.451 |
| 5369 | 322.271 |
| 5370 | 321.271 |
| 5371 | 324.411 |
| 5372 | 323.411 |
| 5373 | 322.411 |
| 5374 | 321.411 |
| 5375 | 320.411 |
| 5376 | 319.411 |
| 5377 | 318.411 |
| 5378 | 321.201 |
| 5379 | 320.201 |
| 5380 | 319.201 |
| 5381 | 318.201 |
| 5382 | 317.201 |
| 5383 | 316.201 |
| 5384 | 320.021 |
| 5385 | 323.061 |
| 5386 | 322.061 |
| 5387 | 321.061 |
| 5388 | 324.291 |
| 5389 | 323.291 |
| 5390 | 322.291 |
| 5391 | 324.981 |
| 5392 | 323.981 |
| 5393 | 322.981 |
| 5394 | 321.981 |
| 5395 | 320.981 |
| 5396 | 319.981 |
| 5397 | 318.981 |
| 5398 | 317.981 |
| 5399 | 316.981 |
| 5400 | 315.981 |
| 5401 | 314.981 |
| 5402 | 318.411 |
| 5403 | 317.411 |
| 5404 | 316.411 |
| 5405 | 319.301 |
| 5406 | 318.301 |
| 5407 | 317.301 |
| 5408 | 320.241 |
| 5409 | 319.241 |
| 5410 | 318.241 |
| 5411 | 317.241 |
| 5412 | 316.241 |
| 5413 | 315.241 |
| 5414 | 314.241 |
| 5415 | 313.241 |
| 5416 | 312.241 |
| 5417 | 311.241 |
| 5418 | 310.241 |
| 5419 | 309.241 |
| 5420 | 312.131 |
| 5421 | 311.131 |
| 5422 | 315.831 |
| 5423 | 314.831 |
| 5424 | 313.831 |
| 5425 | 312.831 |
| 5426 | 316.551 |
| 5427 | 315.551 |
| 5428 | 314.551 |
| 5429 | 318.081 |
| 5430 | 317.081 |
| 5431 | 316.081 |
| 5432 | 315.081 |
| 5433 | 318.121 |
| 5434 | 321.061 |
| 5435 | 320.061 |
| 5436 | 323.491 |
| 5437 | 322.491 |
| 5438 | 325.721 |
| 5439 | 328.411 |
| 5440 | 327.411 |
| 5441 | 326.411 |
| 5442 | 330.041 |
| 5443 | 332.881 |
| 5444 | 331.881 |
| 5445 | 330.881 |
| 5446 | 329.881 |
| 5447 | 328.881 |
| 5448 | 331.721 |
| 5449 | 335.741 |
| 5450 | 334.741 |
| 5451 | 333.741 |
| 5452 | 332.741 |
| 5453 | 331.741 |
| 5454 | 330.741 |
| 5455 | 329.741 |
| 5456 | 328.741 |
| 5457 | 332.461 |
| 5458 | 331.461 |
| 5459 | 330.461 |
| 5460 | 329.461 |
| 5461 | 333.181 |
| 5462 | 332.181 |
| 5463 | 331.181 |
| 5464 | 330.181 |
| 5465 | 332.871 |
| 5466 | 331.871 |
| 5467 | 330.871 |
| 5468 | 329.871 |
| 5469 | 328.871 |
| 5470 | 327.871 |
| 5471 | 326.871 |
| 5472 | 325.871 |
| 5473 | 329.501 |
| 5474 | 328.501 |
| 5475 | 327.501 |
| 5476 | 330.441 |
| 5477 | 329.441 |
| 5478 | 328.441 |
| 5479 | 327.441 |
| 5480 | 326.441 |
| 5481 | 325.441 |
| 5482 | 324.441 |
| 5483 | 323.441 |
| 5484 | 322.441 |
| 5485 | 321.441 |
| 5486 | 325.561 |
| 5487 | 324.561 |
| 5488 | 323.561 |
| 5489 | 322.561 |
| 5490 | 325.601 |
| 5491 | 324.601 |
| 5492 | 328.911 |
| 5493 | 327.911 |
| 5494 | 326.911 |
| 5495 | 329.951 |
| 5496 | 328.951 |
| 5497 | 327.951 |
| 5498 | 326.951 |
| 5499 | 325.951 |
| 5500 | 324.951 |
| 5501 | 323.951 |
| 5502 | 322.951 |
| 5503 | 321.951 |
| 5504 | 320.951 |
| 5505 | 319.951 |
| 5506 | 318.951 |
| 5507 | 322.581 |
| 5508 | 326.891 |
| 5509 | 330.321 |
| 5510 | 329.321 |
| 5511 | 328.321 |
| 5512 | 327.321 |
| 5513 | 326.321 |
| 5514 | 325.321 |
| 5515 | 324.321 |
| 5516 | 323.321 |
| 5517 | 322.321 |
| 5518 | 321.321 |
| 5519 | 320.321 |
| 5520 | 319.321 |
| 5521 | 318.321 |
| 5522 | 317.321 |
| 5523 | 316.321 |
| 5524 | 315.321 |
| 5525 | 314.321 |
| 5526 | 313.321 |
| 5527 | 312.321 |
| 5528 | 311.321 |
| 5529 | 310.321 |
| 5530 | 319.141 |
| 5531 | 318.141 |
| 5532 | 317.141 |
| 5533 | 316.141 |
| 5534 | 315.141 |
| 5535 | 314.141 |
| 5536 | 313.141 |
| 5537 | 312.141 |
| 5538 | 311.141 |
| 5539 | 310.141 |
| 5540 | 314.261 |
| 5541 | 313.261 |
| 5542 | 312.261 |
| 5543 | 311.261 |
| 5544 | 316.361 |
| 5545 | 315.361 |
| 5546 | 314.361 |
| 5547 | 313.361 |
| 5548 | 317.381 |
| 5549 | 316.381 |
| 5550 | 315.381 |
| 5551 | 314.381 |
| 5552 | 313.381 |
| 5553 | 312.381 |
| 5554 | 311.381 |
| 5555 | 310.381 |
| 5556 | 309.381 |
| 5557 | 308.381 |
| 5558 | 307.381 |
| 5559 | 306.381 |
| 5560 | 305.381 |
| 5561 | 309.301 |
| 5562 | 308.301 |
| 5563 | 307.301 |
| 5564 | 306.301 |
| 5565 | 305.301 |
| 5566 | 304.301 |
| 5567 | 303.301 |
| 5568 | 302.301 |
| 5569 | 306.421 |
| 5570 | 310.831 |
| 5571 | 309.831 |
| 5572 | 313.751 |
| 5573 | 312.751 |
| 5574 | 316.771 |
| 5575 | 315.771 |
| 5576 | 319.941 |
| 5577 | 318.911 |
| 5578 | 317.911 |
| 5579 | 316.911 |
| 5580 | 315.911 |
| 5581 | 314.911 |
| 5582 | 318.931 |
| 5583 | 317.931 |
| 5584 | 316.931 |
| 5585 | 315.931 |
| 5586 | 314.931 |
| 5587 | 313.931 |
| 5588 | 312.931 |
| 5589 | 311.931 |
| 5590 | 310.931 |
| 5591 | 309.931 |
| 5592 | 308.931 |
| 5593 | 307.931 |
| 5594 | 306.931 |
| 5595 | 305.931 |
| 5596 | 310.911 |
| 5597 | 309.891 |
| 5598 | 308.871 |
| 5599 | 307.871 |
| 5600 | 306.871 |
| 5601 | 315.791 |
| 5602 | 314.711 |
| 5603 | 313.711 |
| 5604 | 312.711 |
| 5605 | 311.711 |
| 5606 | 310.711 |
| 5607 | 309.711 |
| 5608 | 308.711 |
| 5609 | 307.711 |
| 5610 | 306.711 |
| 5611 | 305.711 |
| 5612 | 304.711 |
| 5613 | 303.711 |
| 5614 | 302.711 |
| 5615 | 301.711 |
| 5616 | 300.711 |
| 5617 | 299.711 |
| 5618 | 298.711 |
| 5619 | 297.711 |
| 5620 | 296.711 |
| 5621 | 295.711 |
| 5622 | 294.711 |
| 5623 | 300.861 |
| 5624 | 299.811 |
| 5625 | 304.076 |
| 5626 | 303.041 |
| 5627 | 302.041 |
| 5628 | 301.041 |
| 5629 | 300.041 |
| 5630 | 299.041 |
| 5631 | 298.041 |
| 5632 | 297.041 |
| 5633 | 304.376 |
| 5634 | 303.311 |
| 5635 | 302.311 |
| 5636 | 301.311 |
| 5637 | 300.311 |
| 5638 | 299.311 |
| 5639 | 298.311 |
| 5640 | 306.836 |
| 5641 | 305.761 |
| 5642 | 304.761 |
| 5643 | 303.761 |
| 5644 | 307.831 |
| 5645 | 306.801 |
| 5646 | 305.801 |
| 5647 | 304.801 |
| 5648 | 303.744 |
| 5649 | 302.688 |
| 5650 | 313.131 |
| 5651 | 312.131 |
| 5652 | 311.131 |
| 5653 | 310.131 |
| 5654 | 309.131 |
| 5655 | 308.051 |
| 5656 | 316.971 |
| 5657 | 315.971 |
| 5658 | 314.971 |
| 5659 | 313.971 |
| 5660 | 312.971 |
| 5661 | 311.971 |
| 5662 | 310.971 |
| 5663 | 309.971 |
| 5664 | 308.903 |
| 5665 | 307.835 |
| 5666 | 306.767 |
| 5667 | 327.699 |
| 5668 | 326.631 |
| 5669 | 325.601 |
| 5670 | 334.571 |
| 5671 | 333.541 |
| 5672 | 332.511 |
| 5673 | 343.411 |
| 5674 | 342.311 |
| 5675 | 341.311 |
| 5676 | 340.311 |
| 5677 | 339.311 |
| 5678 | 338.311 |
| 5679 | 337.311 |
| 5680 | 336.311 |
| 5681 | 335.311 |
| 5682 | 334.311 |
| 5683 | 333.311 |
| 5684 | 332.311 |
| 5685 | 331.311 |
| 5686 | 330.311 |
| 5687 | 329.311 |
| 5688 | 332.901 |
| 5689 | 331.891 |
| 5690 | 330.881 |
| 5691 | 329.881 |
| 5692 | 328.881 |
| 5693 | 327.881 |
| 5694 | 326.881 |
| 5695 | 325.881 |
| 5696 | 324.881 |
| 5697 | 323.881 |
| 5698 | 322.881 |
| 5699 | 321.881 |
| 5700 | 320.881 |
| 5701 | 319.814 |
| 5702 | 318.748 |
| 5703 | 330.681 |
| 5704 | 329.546 |
| 5705 | 343.911 |
| 5706 | 342.911 |
| 5707 | 341.911 |
| 5708 | 340.911 |
| 5709 | 339.911 |
| 5710 | 338.911 |
| 5711 | 337.911 |
| 5712 | 336.911 |
| 5713 | 335.911 |
| 5714 | 334.911 |
| 5715 | 342.051 |
| 5716 | 340.991 |
| 5717 | 339.991 |
| 5718 | 338.991 |
| 5719 | 337.991 |
| 5720 | 336.991 |
| 5721 | 335.991 |
| 5722 | 334.991 |
| 5723 | 333.991 |
| 5724 | 332.991 |
| 5725 | 331.991 |
| 5726 | 335.466 |
| 5727 | 334.441 |
| 5728 | 333.441 |
| 5729 | 332.441 |
| 5730 | 331.441 |
| 5731 | 330.441 |
| 5732 | 329.441 |
| 5733 | 328.441 |
| 5734 | 327.441 |
| 5735 | 326.441 |
| 5736 | 325.441 |
| 5737 | 324.441 |
| 5738 | 323.441 |
| 5739 | 330.804 |
| 5740 | 329.768 |
| 5741 | 328.731 |
| 5742 | 327.731 |
| 5743 | 326.731 |
| 5744 | 325.731 |
| 5745 | 328.924 |
| 5746 | 327.918 |
| 5747 | 326.911 |
| 5748 | 325.911 |
| 5749 | 324.911 |
| 5750 | 323.911 |
| 5751 | 322.911 |
| 5752 | 321.911 |
| 5753 | 320.911 |
| 5754 | 319.911 |
| 5755 | 318.911 |
| 5756 | 317.911 |
| 5757 | 316.911 |
| 5758 | 315.911 |
| 5759 | 314.911 |
| 5760 | 313.911 |
| 5761 | 312.911 |
| 5762 | 311.911 |
| 5763 | 310.911 |
| 5764 | 309.911 |
| 5765 | 308.911 |
| 5766 | 307.801 |
| 5767 | 319.691 |
| 5768 | 318.631 |
| 5769 | 325.371 |
| 5770 | 324.371 |
| 5771 | 323.371 |
| 5772 | 322.024 |
| 5773 | 320.678 |
| 5774 | 374.331 |
| 5775 | 373.331 |
| 5776 | 372.331 |
| 5777 | 371.331 |
| 5778 | 370.331 |
| 5779 | 369.331 |
| 5780 | 368.331 |
| 5781 | 367.331 |
| 5782 | 366.331 |
| 5783 | 365.331 |
| 5784 | 364.331 |
| 5785 | 363.331 |
| 5786 | 362.331 |
| 5787 | 361.331 |
| 5788 | 360.331 |
| 5789 | 359.331 |
| 5790 | 358.331 |
| 5791 | 357.331 |
| 5792 | 356.331 |
| 5793 | 355.331 |
| 5794 | 354.331 |
| 5795 | 353.331 |
| 5796 | 352.331 |
| 5797 | 351.331 |
| 5798 | 350.331 |
| 5799 | 349.331 |
| 5800 | 348.331 |
| 5801 | 347.331 |
| 5802 | 346.331 |
| 5803 | 345.331 |
| 5804 | 344.331 |
| 5805 | 343.331 |
| 5806 | 342.331 |
| 5807 | 341.331 |
| 5808 | 340.331 |
| 5809 | 339.331 |
| 5810 | 338.331 |
| 5811 | 337.331 |
| 5812 | 336.331 |
| 5813 | 335.331 |
| 5814 | 334.331 |
| 5815 | 333.331 |
| 5816 | 332.331 |
| 5817 | 331.331 |
| 5818 | 330.331 |
| 5819 | 329.331 |
| 5820 | 328.331 |
| 5821 | 327.331 |
| 5822 | 326.331 |
| 5823 | 325.331 |
| 5824 | 324.331 |
| 5825 | 323.331 |
| 5826 | 322.331 |
| 5827 | 321.331 |
| 5828 | 320.331 |
| 5829 | 319.331 |
| 5830 | 318.331 |
| 5831 | 317.331 |
| 5832 | 316.331 |
| 5833 | 315.331 |
| 5834 | 314.331 |
| 5835 | 313.331 |
| 5836 | 312.331 |
| 5837 | 311.331 |
| 5838 | 316.521 |
| 5839 | 315.511 |
| 5840 | 314.501 |
| 5841 | 313.491 |
| 5842 | 312.491 |
| 5843 | 311.491 |
| 5844 | 310.491 |
| 5845 | 309.491 |
| 5846 | 308.491 |
| 5847 | 307.491 |
| 5848 | 306.491 |
| 5849 | 305.491 |
| 5850 | 304.491 |
| 5851 | 303.491 |
| 5852 | 302.491 |
| 5853 | 301.491 |
| 5854 | 300.491 |
| 5855 | 299.491 |
| 5856 | 298.491 |
| 5857 | 297.491 |
| 5858 | 296.491 |
| 5859 | 295.491 |
| 5860 | 294.491 |
| 5861 | 293.491 |
| 5862 | 297.066 |
| 5863 | 296.041 |
| 5864 | 295.041 |
| 5865 | 294.041 |
| 5866 | 298.111 |
| 5867 | 297.081 |
| 5868 | 310.456 |
| 5869 | 309.331 |
| 5870 | 308.331 |
| 5871 | 307.331 |
| 5872 | 306.331 |
| 5873 | 305.331 |
| 5874 | 304.331 |
| 5875 | 303.331 |
| 5876 | 302.331 |
| 5877 | 301.331 |
| 5878 | 300.331 |
| 5879 | 299.331 |
| 5880 | 298.331 |
| 5881 | 297.331 |
| 5882 | 296.331 |
| 5883 | 295.331 |
| 5884 | 294.331 |
| 5885 | 293.331 |
| 5886 | 292.331 |
| 5887 | 291.331 |
| 5888 | 290.331 |
| 5889 | 289.331 |
| 5890 | 307.161 |
| 5891 | 305.991 |
| 5892 | 304.991 |
| 5893 | 303.991 |
| 5894 | 312.516 |
| 5895 | 311.441 |
| 5896 | 310.441 |
| 5897 | 309.441 |
| 5898 | 308.441 |
| 5899 | 307.364 |
| 5900 | 320.788 |
| 5901 | 319.711 |
| 5902 | 318.711 |
| 5903 | 317.711 |
| 5904 | 316.711 |
| 5905 | 315.711 |
| 5906 | 314.711 |
| 5907 | 313.711 |
| 5908 | 312.711 |
| 5909 | 311.711 |
| 5910 | 310.711 |
| 5911 | 309.711 |
| 5912 | 308.711 |
| 5913 | 307.711 |
| 5914 | 306.711 |
| 5915 | 305.711 |
| 5916 | 304.711 |
| 5917 | 303.711 |
| 5918 | 302.711 |
| 5919 | 301.711 |
| 5920 | 300.711 |
| 5921 | 299.711 |
| 5922 | 298.671 |
| 5923 | 306.431 |
| 5924 | 305.391 |
| 5925 | 304.324 |
| 5926 | 303.256 |
| 5927 | 319.689 |
| 5928 | 318.621 |
| 5929 | 317.621 |
| 5930 | 316.621 |
| 5931 | 325.541 |
| 5932 | 324.461 |
| 5933 | 323.461 |
| 5934 | 322.461 |
| 5935 | 321.461 |
| 5936 | 326.351 |
| 5937 | 325.341 |
| 5938 | 324.331 |
| 5939 | 323.321 |
| 5940 | 322.321 |
| 5941 | 321.321 |
| 5942 | 320.321 |
| 5943 | 319.321 |
| 5944 | 318.321 |
| 5945 | 317.321 |
| 5946 | 316.321 |
| 5947 | 315.321 |
| 5948 | 314.321 |
| 5949 | 313.321 |
| 5950 | 312.277 |
| 5951 | 311.233 |
| 5952 | 310.189 |
| 5953 | 325.145 |
| 5954 | 324.101 |
| 5955 | 323.101 |
| 5956 | 322.101 |
| 5957 | 321.101 |
| 5958 | 320.101 |
| 5959 | 319.101 |
| 5960 | 318.101 |
| 5961 | 317.101 |
| 5962 | 316.101 |
| 5963 | 315.101 |
| 5964 | 314.101 |
| 5965 | 313.101 |
| 5966 | 312.101 |
| 5967 | 311.101 |
| 5968 | 310.101 |
| 5969 | 309.101 |
| 5970 | 308.101 |
| 5971 | 307.101 |
| 5972 | 306.101 |
| 5973 | 305.101 |
| 5974 | 304.101 |
| 5975 | 303.101 |
| 5976 | 302.101 |
| 5977 | 301.101 |
| 5978 | 307.571 |
| 5979 | 306.571 |
| 5980 | 311.471 |
| 5981 | 310.471 |
| 5982 | 309.471 |
| 5983 | 315.551 |
| 5984 | 314.551 |
| 5985 | 321.611 |
| 5986 | 320.611 |
| 5987 | 319.611 |
| 5988 | 318.611 |
| 5989 | 317.611 |
| 5990 | 316.611 |
| 5991 | 315.611 |
| 5992 | 314.611 |
| 5993 | 313.611 |
| 5994 | 312.611 |
| 5995 | 311.611 |
| 5996 | 310.611 |
| 5997 | 317.271 |
| 5998 | 322.171 |
| 5999 | 321.171 |
| 6000 | 320.171 |
| 6001 | 325.461 |
| 6002 | 324.461 |
| 6003 | 323.461 |
| 6004 | 322.461 |
| 6005 | 321.461 |
| 6006 | 320.461 |
| 6007 | 319.461 |
| 6008 | 318.461 |
| 6009 | 317.461 |
| 6010 | 316.461 |
| 6011 | 315.461 |
| 6012 | 314.461 |
| 6013 | 313.461 |
| 6014 | 312.461 |
| 6015 | 311.461 |
| 6016 | 319.501 |
| 6017 | 318.501 |
| 6018 | 317.501 |
| 6019 | 316.501 |
| 6020 | 315.501 |
| 6021 | 314.501 |
| 6022 | 319.601 |
| 6023 | 326.661 |
| 6024 | 325.661 |
| 6025 | 324.661 |
| 6026 | 329.951 |
| 6027 | 328.951 |
| 6028 | 327.951 |
| 6029 | 326.951 |
| 6030 | 325.951 |
| 6031 | 324.951 |
| 6032 | 323.951 |
| 6033 | 329.441 |
| 6034 | 328.441 |
| 6035 | 327.441 |
| 6036 | 326.441 |
| 6037 | 331.341 |
| 6038 | 330.341 |
| 6039 | 329.341 |
| 6040 | 328.341 |
| 6041 | 327.341 |
| 6042 | 326.341 |
| 6043 | 325.341 |
| 6044 | 324.341 |
| 6045 | 323.341 |
| 6046 | 329.221 |
| 6047 | 328.221 |
| 6048 | 327.221 |
| 6049 | 326.221 |
| 6050 | 325.221 |
| 6051 | 324.221 |
| 6052 | 332.651 |
| 6053 | 331.651 |
| 6054 | 330.651 |
| 6055 | 329.651 |
| 6056 | 328.651 |
| 6057 | 334.921 |
| 6058 | 333.921 |
| 6059 | 332.921 |
| 6060 | 331.921 |
| 6061 | 330.921 |
| 6062 | 329.921 |
| 6063 | 328.921 |
| 6064 | 327.921 |
| 6065 | 326.921 |
| 6066 | 325.921 |
| 6067 | 324.921 |
| 6068 | 323.921 |
| 6069 | 329.211 |
| 6070 | 328.211 |
| 6071 | 327.211 |
| 6072 | 326.211 |
| 6073 | 325.211 |
| 6074 | 324.211 |
| 6075 | 330.871 |
| 6076 | 329.871 |
| 6077 | 328.871 |
| 6078 | 327.871 |
| 6079 | 326.871 |
| 6080 | 325.871 |
| 6081 | 331.161 |
| 6082 | 330.161 |
| 6083 | 329.161 |
| 6084 | 328.161 |
| 6085 | 327.161 |
| 6086 | 326.161 |
| 6087 | 325.161 |
| 6088 | 324.161 |
| 6089 | 323.161 |
| 6090 | 322.161 |
| 6091 | 321.161 |
| 6092 | 327.041 |
| 6093 | 326.041 |
| 6094 | 332.121 |
| 6095 | 331.121 |
| 6096 | 330.121 |
| 6097 | 337.961 |
| 6098 | 336.961 |
| 6099 | 335.961 |
| 6100 | 334.961 |
| 6101 | 333.961 |
| 6102 | 332.961 |
| 6103 | 339.821 |
| 6104 | 338.821 |
| 6105 | 337.821 |
| 6106 | 336.821 |
| 6107 | 341.721 |
| 6108 | 340.721 |
| 6109 | 339.721 |
| 6110 | 338.721 |
| 6111 | 337.721 |
| 6112 | 336.721 |
| 6113 | 335.721 |
| 6114 | 344.541 |
| 6115 | 343.541 |
| 6116 | 342.541 |
| 6117 | 348.221 |
| 6118 | 347.221 |
| 6119 | 346.221 |
| 6120 | 345.221 |
| 6121 | 344.221 |
| 6122 | 343.221 |
| 6123 | 342.221 |
| 6124 | 341.221 |
| 6125 | 340.221 |
| 6126 | 339.221 |
| 6127 | 338.221 |
| 6128 | 337.221 |
| 6129 | 336.221 |
| 6130 | 335.221 |
| 6131 | 334.221 |
| 6132 | 333.221 |
| 6133 | 332.221 |
| 6134 | 331.221 |
| 6135 | 330.221 |
| 6136 | 329.221 |
| 6137 | 328.221 |
| 6138 | 327.221 |